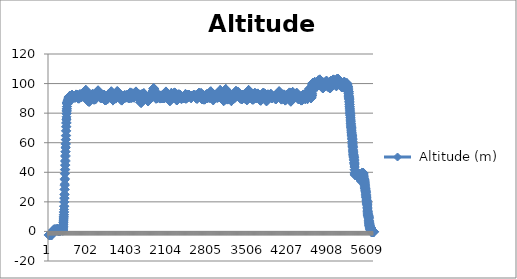
| Category |  Altitude (m) |
|---|---|
| 0 | -2.5 |
| 1 | -2.5 |
| 2 | -2.333 |
| 3 | -2.333 |
| 4 | -2.333 |
| 5 | -2.333 |
| 6 | -2.333 |
| 7 | -2.167 |
| 8 | -2.333 |
| 9 | -2.333 |
| 10 | -2.167 |
| 11 | -2.167 |
| 12 | -2.333 |
| 13 | -2.333 |
| 14 | -2.167 |
| 15 | -2.167 |
| 16 | -2.167 |
| 17 | -2.167 |
| 18 | -2.167 |
| 19 | -2.167 |
| 20 | -2.167 |
| 21 | -2.167 |
| 22 | -2.167 |
| 23 | -2 |
| 24 | -2 |
| 25 | -2.167 |
| 26 | -2.167 |
| 27 | -2.167 |
| 28 | -2.167 |
| 29 | -2.167 |
| 30 | -2.333 |
| 31 | -2.167 |
| 32 | -2.167 |
| 33 | -2.333 |
| 34 | -2.333 |
| 35 | -2.333 |
| 36 | -2.167 |
| 37 | -2.167 |
| 38 | -2.167 |
| 39 | -2.167 |
| 40 | -2.167 |
| 41 | -2 |
| 42 | -2 |
| 43 | -2 |
| 44 | -2 |
| 45 | -2.167 |
| 46 | -2.167 |
| 47 | -2.167 |
| 48 | -2.333 |
| 49 | -2.333 |
| 50 | -2.333 |
| 51 | -0.167 |
| 52 | -0.167 |
| 53 | -0.167 |
| 54 | -0.167 |
| 55 | -0.333 |
| 56 | -0.167 |
| 57 | -0.167 |
| 58 | -0.167 |
| 59 | -0.167 |
| 60 | 0 |
| 61 | -0.167 |
| 62 | 0 |
| 63 | 0.167 |
| 64 | 0 |
| 65 | -0.167 |
| 66 | -0.167 |
| 67 | -0.167 |
| 68 | -0.167 |
| 69 | -0.167 |
| 70 | -0.167 |
| 71 | 0 |
| 72 | 0 |
| 73 | -0.167 |
| 74 | -0.167 |
| 75 | -0.167 |
| 76 | -0.167 |
| 77 | 0.5 |
| 78 | 0.667 |
| 79 | 1 |
| 80 | 1 |
| 81 | 1 |
| 82 | 1.167 |
| 83 | 1.333 |
| 84 | 1.167 |
| 85 | 1.333 |
| 86 | 1.167 |
| 87 | 1 |
| 88 | 1.167 |
| 89 | 1.167 |
| 90 | 1.167 |
| 91 | 1.333 |
| 92 | 1.333 |
| 93 | 1.333 |
| 94 | 1.333 |
| 95 | 1.333 |
| 96 | 1.333 |
| 97 | 1.333 |
| 98 | 1.167 |
| 99 | 1.167 |
| 100 | 1.333 |
| 101 | 1.333 |
| 102 | 1.333 |
| 103 | 1.5 |
| 104 | 1.167 |
| 105 | 1.167 |
| 106 | 1 |
| 107 | 1.167 |
| 108 | 1.167 |
| 109 | 1 |
| 110 | 1 |
| 111 | 1 |
| 112 | 1.167 |
| 113 | 1.167 |
| 114 | 1.167 |
| 115 | 1.333 |
| 116 | 1.333 |
| 117 | 1.333 |
| 118 | 1.333 |
| 119 | 1.333 |
| 120 | 1.333 |
| 121 | 1.333 |
| 122 | 1.333 |
| 123 | 1.167 |
| 124 | 1.167 |
| 125 | 1.333 |
| 126 | 1.333 |
| 127 | 1.333 |
| 128 | 1.333 |
| 129 | 1.333 |
| 130 | 1.333 |
| 131 | 1.333 |
| 132 | 1.167 |
| 133 | 1.333 |
| 134 | 1.167 |
| 135 | 1.167 |
| 136 | 1.333 |
| 137 | 1.333 |
| 138 | 1.167 |
| 139 | 1.167 |
| 140 | 0.833 |
| 141 | 1 |
| 142 | 1 |
| 143 | 1.5 |
| 144 | 1.5 |
| 145 | 1.5 |
| 146 | 1.5 |
| 147 | 1.833 |
| 148 | 1.667 |
| 149 | 1.833 |
| 150 | 1.667 |
| 151 | 1.333 |
| 152 | 1.333 |
| 153 | 1.167 |
| 154 | 1.333 |
| 155 | 1.167 |
| 156 | 1.167 |
| 157 | 0.833 |
| 158 | 0.833 |
| 159 | 0.5 |
| 160 | 0.5 |
| 161 | 0.333 |
| 162 | 0.333 |
| 163 | 0.5 |
| 164 | 0.333 |
| 165 | 0.5 |
| 166 | 0.5 |
| 167 | 0.5 |
| 168 | 0.333 |
| 169 | 0.167 |
| 170 | 0.333 |
| 171 | 0.167 |
| 172 | 0.167 |
| 173 | 0.167 |
| 174 | 0.167 |
| 175 | 0.333 |
| 176 | 0.5 |
| 177 | 0.5 |
| 178 | 0.333 |
| 179 | 0.333 |
| 180 | 0.667 |
| 181 | 0.5 |
| 182 | 0.667 |
| 183 | 0.667 |
| 184 | 0.833 |
| 185 | 0.667 |
| 186 | 0.667 |
| 187 | 0.667 |
| 188 | 0.833 |
| 189 | 0.833 |
| 190 | 0.667 |
| 191 | 0.5 |
| 192 | 0.5 |
| 193 | 0.333 |
| 194 | 0.5 |
| 195 | 0.667 |
| 196 | 0.667 |
| 197 | 0.5 |
| 198 | 0.667 |
| 199 | 0.667 |
| 200 | 0.667 |
| 201 | 0.833 |
| 202 | 0.833 |
| 203 | 0.667 |
| 204 | 0.667 |
| 205 | 0.667 |
| 206 | 0.833 |
| 207 | 0.833 |
| 208 | 0.667 |
| 209 | 0.667 |
| 210 | 0.667 |
| 211 | 0.667 |
| 212 | 0.667 |
| 213 | 0.667 |
| 214 | 0.667 |
| 215 | 0.833 |
| 216 | 0.833 |
| 217 | 0.833 |
| 218 | 1 |
| 219 | 1 |
| 220 | 0.833 |
| 221 | 0.833 |
| 222 | 1 |
| 223 | 1 |
| 224 | 1 |
| 225 | 1 |
| 226 | 1 |
| 227 | 1 |
| 228 | 1 |
| 229 | 1 |
| 230 | 0.833 |
| 231 | 1 |
| 232 | 1 |
| 233 | 1 |
| 234 | 0.833 |
| 235 | 1 |
| 236 | 1 |
| 237 | 0.833 |
| 238 | 0.667 |
| 239 | 0.667 |
| 240 | 0.5 |
| 241 | 0.5 |
| 242 | 1.167 |
| 243 | 1.333 |
| 244 | 1.833 |
| 245 | 2.333 |
| 246 | 2.5 |
| 247 | 3.167 |
| 248 | 3.333 |
| 249 | 4.333 |
| 250 | 4.667 |
| 251 | 5.833 |
| 252 | 5.833 |
| 253 | 7 |
| 254 | 7.167 |
| 255 | 8.333 |
| 256 | 8.5 |
| 257 | 9.667 |
| 258 | 10 |
| 259 | 11.167 |
| 260 | 11.5 |
| 261 | 12.833 |
| 262 | 13.333 |
| 263 | 14.833 |
| 264 | 16.833 |
| 265 | 17.167 |
| 266 | 19.833 |
| 267 | 20 |
| 268 | 22.333 |
| 269 | 22.667 |
| 270 | 24.833 |
| 271 | 25.167 |
| 272 | 28.333 |
| 273 | 28.5 |
| 274 | 31.167 |
| 275 | 32 |
| 276 | 35 |
| 277 | 35.667 |
| 278 | 39 |
| 279 | 39.167 |
| 280 | 41.667 |
| 281 | 42 |
| 282 | 44.667 |
| 283 | 45 |
| 284 | 47.333 |
| 285 | 48 |
| 286 | 50.667 |
| 287 | 51.333 |
| 288 | 53.833 |
| 289 | 54 |
| 290 | 56.5 |
| 291 | 57 |
| 292 | 59 |
| 293 | 59.5 |
| 294 | 62 |
| 295 | 62.167 |
| 296 | 64.667 |
| 297 | 65 |
| 298 | 68 |
| 299 | 68 |
| 300 | 70.667 |
| 301 | 71 |
| 302 | 73.167 |
| 303 | 73.667 |
| 304 | 75.5 |
| 305 | 76 |
| 306 | 77.5 |
| 307 | 79.5 |
| 308 | 79.833 |
| 309 | 81.333 |
| 310 | 81.667 |
| 311 | 82.833 |
| 312 | 83 |
| 313 | 84.333 |
| 314 | 84.5 |
| 315 | 86.167 |
| 316 | 86.5 |
| 317 | 87.333 |
| 318 | 87.5 |
| 319 | 87.333 |
| 320 | 87.333 |
| 321 | 86.833 |
| 322 | 86.833 |
| 323 | 86.333 |
| 324 | 86.5 |
| 325 | 86.167 |
| 326 | 86.333 |
| 327 | 86.833 |
| 328 | 87 |
| 329 | 87.833 |
| 330 | 87.833 |
| 331 | 88.333 |
| 332 | 88.333 |
| 333 | 88.333 |
| 334 | 88.5 |
| 335 | 88.667 |
| 336 | 88.667 |
| 337 | 88.833 |
| 338 | 89 |
| 339 | 89.167 |
| 340 | 89.333 |
| 341 | 89.5 |
| 342 | 89.5 |
| 343 | 89.667 |
| 344 | 89.667 |
| 345 | 90 |
| 346 | 90 |
| 347 | 90.5 |
| 348 | 90.5 |
| 349 | 90.833 |
| 350 | 90.833 |
| 351 | 91.167 |
| 352 | 91.167 |
| 353 | 91.167 |
| 354 | 91 |
| 355 | 91 |
| 356 | 91 |
| 357 | 91.167 |
| 358 | 91 |
| 359 | 91.333 |
| 360 | 91.333 |
| 361 | 91.333 |
| 362 | 91.333 |
| 363 | 91.5 |
| 364 | 91.5 |
| 365 | 91.5 |
| 366 | 91.667 |
| 367 | 91.5 |
| 368 | 91.667 |
| 369 | 91.5 |
| 370 | 91.5 |
| 371 | 91.333 |
| 372 | 91.333 |
| 373 | 91.333 |
| 374 | 91.333 |
| 375 | 91.167 |
| 376 | 91.333 |
| 377 | 91.5 |
| 378 | 91.333 |
| 379 | 91.333 |
| 380 | 91.333 |
| 381 | 91.167 |
| 382 | 91.167 |
| 383 | 91.333 |
| 384 | 91.5 |
| 385 | 91.5 |
| 386 | 91.5 |
| 387 | 91.5 |
| 388 | 91.5 |
| 389 | 91.667 |
| 390 | 91.5 |
| 391 | 91.667 |
| 392 | 91.5 |
| 393 | 91.667 |
| 394 | 91.667 |
| 395 | 91.5 |
| 396 | 91.5 |
| 397 | 91.667 |
| 398 | 91.667 |
| 399 | 92 |
| 400 | 92 |
| 401 | 92.167 |
| 402 | 92.167 |
| 403 | 92.333 |
| 404 | 92.333 |
| 405 | 92.333 |
| 406 | 92.333 |
| 407 | 92.333 |
| 408 | 92.333 |
| 409 | 91.833 |
| 410 | 91.833 |
| 411 | 91.167 |
| 412 | 91.333 |
| 413 | 90.5 |
| 414 | 90.5 |
| 415 | 90.333 |
| 416 | 90.333 |
| 417 | 90.167 |
| 418 | 90.167 |
| 419 | 90.667 |
| 420 | 90.667 |
| 421 | 90.667 |
| 422 | 90.833 |
| 423 | 90.833 |
| 424 | 90.833 |
| 425 | 90.667 |
| 426 | 90.667 |
| 427 | 90.667 |
| 428 | 90.667 |
| 429 | 90.667 |
| 430 | 90.667 |
| 431 | 90.833 |
| 432 | 90.833 |
| 433 | 91.167 |
| 434 | 91.167 |
| 435 | 91.333 |
| 436 | 91.333 |
| 437 | 91 |
| 438 | 91.167 |
| 439 | 91.167 |
| 440 | 91.167 |
| 441 | 91.333 |
| 442 | 91.333 |
| 443 | 91.333 |
| 444 | 91.167 |
| 445 | 91.167 |
| 446 | 91 |
| 447 | 90.833 |
| 448 | 90.667 |
| 449 | 90.5 |
| 450 | 90.5 |
| 451 | 90.5 |
| 452 | 90.5 |
| 453 | 90.5 |
| 454 | 90.667 |
| 455 | 90.667 |
| 456 | 90.5 |
| 457 | 90.5 |
| 458 | 90.833 |
| 459 | 90.667 |
| 460 | 90.667 |
| 461 | 90.667 |
| 462 | 90.833 |
| 463 | 91 |
| 464 | 91.333 |
| 465 | 91.333 |
| 466 | 91.5 |
| 467 | 91.667 |
| 468 | 91.667 |
| 469 | 91.667 |
| 470 | 91.833 |
| 471 | 91.667 |
| 472 | 92.5 |
| 473 | 92.5 |
| 474 | 92.5 |
| 475 | 92.5 |
| 476 | 92.167 |
| 477 | 92 |
| 478 | 91.667 |
| 479 | 91.5 |
| 480 | 91.5 |
| 481 | 91.5 |
| 482 | 92 |
| 483 | 92.167 |
| 484 | 92.333 |
| 485 | 92.167 |
| 486 | 92.333 |
| 487 | 92.333 |
| 488 | 92.333 |
| 489 | 92.167 |
| 490 | 92.167 |
| 491 | 92 |
| 492 | 92.167 |
| 493 | 92.167 |
| 494 | 92.167 |
| 495 | 92.167 |
| 496 | 92.167 |
| 497 | 92.333 |
| 498 | 92.333 |
| 499 | 92 |
| 500 | 92 |
| 501 | 91.5 |
| 502 | 91.5 |
| 503 | 91 |
| 504 | 91 |
| 505 | 91 |
| 506 | 90.833 |
| 507 | 90.667 |
| 508 | 90.667 |
| 509 | 90.333 |
| 510 | 90.167 |
| 511 | 89.833 |
| 512 | 89.833 |
| 513 | 90 |
| 514 | 90 |
| 515 | 90.167 |
| 516 | 90 |
| 517 | 90.333 |
| 518 | 90.167 |
| 519 | 90 |
| 520 | 90.167 |
| 521 | 90 |
| 522 | 90 |
| 523 | 90 |
| 524 | 89.833 |
| 525 | 89.833 |
| 526 | 90 |
| 527 | 90 |
| 528 | 90.167 |
| 529 | 90.167 |
| 530 | 90.167 |
| 531 | 90.167 |
| 532 | 90.5 |
| 533 | 90.667 |
| 534 | 91.333 |
| 535 | 91.5 |
| 536 | 92 |
| 537 | 92.333 |
| 538 | 92.667 |
| 539 | 92.667 |
| 540 | 92.667 |
| 541 | 92.667 |
| 542 | 92.833 |
| 543 | 92.333 |
| 544 | 92.333 |
| 545 | 92.333 |
| 546 | 92.167 |
| 547 | 91.833 |
| 548 | 91.667 |
| 549 | 91.667 |
| 550 | 91.667 |
| 551 | 91.833 |
| 552 | 91.667 |
| 553 | 91.5 |
| 554 | 91.5 |
| 555 | 91.333 |
| 556 | 91.333 |
| 557 | 91.167 |
| 558 | 91.167 |
| 559 | 90.833 |
| 560 | 90.667 |
| 561 | 90.667 |
| 562 | 90.667 |
| 563 | 90.667 |
| 564 | 90.667 |
| 565 | 91 |
| 566 | 91 |
| 567 | 91.167 |
| 568 | 91.167 |
| 569 | 91.333 |
| 570 | 91.333 |
| 571 | 91.333 |
| 572 | 91.333 |
| 573 | 91.5 |
| 574 | 91.667 |
| 575 | 91.667 |
| 576 | 91.667 |
| 577 | 91.667 |
| 578 | 91.333 |
| 579 | 91.333 |
| 580 | 91.333 |
| 581 | 91.333 |
| 582 | 91.5 |
| 583 | 91.5 |
| 584 | 91.833 |
| 585 | 92 |
| 586 | 92.167 |
| 587 | 92.167 |
| 588 | 92.167 |
| 589 | 92.167 |
| 590 | 92.167 |
| 591 | 92.167 |
| 592 | 92.5 |
| 593 | 92.5 |
| 594 | 93 |
| 595 | 93.167 |
| 596 | 93.333 |
| 597 | 93.5 |
| 598 | 93.833 |
| 599 | 93.833 |
| 600 | 93.667 |
| 601 | 93 |
| 602 | 93 |
| 603 | 92.167 |
| 604 | 92.167 |
| 605 | 91.833 |
| 606 | 92 |
| 607 | 91.667 |
| 608 | 91.667 |
| 609 | 91.667 |
| 610 | 91.667 |
| 611 | 92 |
| 612 | 92 |
| 613 | 92.667 |
| 614 | 93 |
| 615 | 93.5 |
| 616 | 93.5 |
| 617 | 93.667 |
| 618 | 93.667 |
| 619 | 93.333 |
| 620 | 93.5 |
| 621 | 93.5 |
| 622 | 93.833 |
| 623 | 93.667 |
| 624 | 93.667 |
| 625 | 93.5 |
| 626 | 93.5 |
| 627 | 93.5 |
| 628 | 93.167 |
| 629 | 93.167 |
| 630 | 93.167 |
| 631 | 93.167 |
| 632 | 93.333 |
| 633 | 93.333 |
| 634 | 94 |
| 635 | 94.167 |
| 636 | 94.667 |
| 637 | 94.667 |
| 638 | 95 |
| 639 | 95.167 |
| 640 | 95.5 |
| 641 | 95.667 |
| 642 | 95.667 |
| 643 | 95.667 |
| 644 | 95 |
| 645 | 94.833 |
| 646 | 94.667 |
| 647 | 94.667 |
| 648 | 94.5 |
| 649 | 94.5 |
| 650 | 93.833 |
| 651 | 93.833 |
| 652 | 93.5 |
| 653 | 93.667 |
| 654 | 93.5 |
| 655 | 93.5 |
| 656 | 93.167 |
| 657 | 93.167 |
| 658 | 92.833 |
| 659 | 92.667 |
| 660 | 92.5 |
| 661 | 92.5 |
| 662 | 92 |
| 663 | 91.833 |
| 664 | 91.5 |
| 665 | 91.5 |
| 666 | 91.333 |
| 667 | 91.333 |
| 668 | 91.167 |
| 669 | 91.167 |
| 670 | 91 |
| 671 | 91 |
| 672 | 91 |
| 673 | 90.5 |
| 674 | 90.333 |
| 675 | 90 |
| 676 | 90 |
| 677 | 89.5 |
| 678 | 89.333 |
| 679 | 88.833 |
| 680 | 88.833 |
| 681 | 88.5 |
| 682 | 88.5 |
| 683 | 88.333 |
| 684 | 88.167 |
| 685 | 88.167 |
| 686 | 88 |
| 687 | 88.333 |
| 688 | 88.333 |
| 689 | 88.167 |
| 690 | 88.167 |
| 691 | 88.333 |
| 692 | 88.333 |
| 693 | 88.333 |
| 694 | 88.333 |
| 695 | 88.5 |
| 696 | 88.5 |
| 697 | 88.167 |
| 698 | 88 |
| 699 | 87.667 |
| 700 | 87.833 |
| 701 | 87.667 |
| 702 | 87.833 |
| 703 | 87.833 |
| 704 | 87.833 |
| 705 | 88.167 |
| 706 | 88.333 |
| 707 | 88.333 |
| 708 | 88.333 |
| 709 | 88.667 |
| 710 | 88.667 |
| 711 | 89 |
| 712 | 89.167 |
| 713 | 89.667 |
| 714 | 89.667 |
| 715 | 89.833 |
| 716 | 90 |
| 717 | 90 |
| 718 | 90 |
| 719 | 89.833 |
| 720 | 89.833 |
| 721 | 89.833 |
| 722 | 90 |
| 723 | 90.167 |
| 724 | 90.167 |
| 725 | 90.5 |
| 726 | 90.5 |
| 727 | 91 |
| 728 | 91.167 |
| 729 | 91.5 |
| 730 | 91.5 |
| 731 | 91.667 |
| 732 | 91.833 |
| 733 | 91.833 |
| 734 | 91.833 |
| 735 | 92 |
| 736 | 92 |
| 737 | 91.833 |
| 738 | 92 |
| 739 | 92 |
| 740 | 92 |
| 741 | 91.833 |
| 742 | 91.833 |
| 743 | 91.667 |
| 744 | 91.667 |
| 745 | 91.833 |
| 746 | 91.833 |
| 747 | 92 |
| 748 | 92.167 |
| 749 | 92.167 |
| 750 | 92.167 |
| 751 | 92.167 |
| 752 | 92.333 |
| 753 | 92.5 |
| 754 | 92.5 |
| 755 | 92.5 |
| 756 | 92.5 |
| 757 | 92.5 |
| 758 | 92.667 |
| 759 | 92.667 |
| 760 | 92.667 |
| 761 | 92.833 |
| 762 | 92.833 |
| 763 | 92.833 |
| 764 | 92.833 |
| 765 | 92.667 |
| 766 | 92.667 |
| 767 | 92.5 |
| 768 | 92.333 |
| 769 | 92.167 |
| 770 | 92.333 |
| 771 | 92.333 |
| 772 | 92 |
| 773 | 91.667 |
| 774 | 90.5 |
| 775 | 90.333 |
| 776 | 89.667 |
| 777 | 89.667 |
| 778 | 89.5 |
| 779 | 89.5 |
| 780 | 89.333 |
| 781 | 89.333 |
| 782 | 89.167 |
| 783 | 89.333 |
| 784 | 89.333 |
| 785 | 89.333 |
| 786 | 89.167 |
| 787 | 89.333 |
| 788 | 89.167 |
| 789 | 89.167 |
| 790 | 89.333 |
| 791 | 89.333 |
| 792 | 89.167 |
| 793 | 89.167 |
| 794 | 89.333 |
| 795 | 89.333 |
| 796 | 89.333 |
| 797 | 89.333 |
| 798 | 89.5 |
| 799 | 89.5 |
| 800 | 89.667 |
| 801 | 89.833 |
| 802 | 89.833 |
| 803 | 90.333 |
| 804 | 90.333 |
| 805 | 90.667 |
| 806 | 90.667 |
| 807 | 90.667 |
| 808 | 90.667 |
| 809 | 90.167 |
| 810 | 90.167 |
| 811 | 89.667 |
| 812 | 89.667 |
| 813 | 89.5 |
| 814 | 89.5 |
| 815 | 89.667 |
| 816 | 89.833 |
| 817 | 89.667 |
| 818 | 89.833 |
| 819 | 90.167 |
| 820 | 90.333 |
| 821 | 90.5 |
| 822 | 90.5 |
| 823 | 91 |
| 824 | 91.167 |
| 825 | 91.667 |
| 826 | 91.667 |
| 827 | 92.333 |
| 828 | 92.333 |
| 829 | 92.667 |
| 830 | 92.667 |
| 831 | 92.667 |
| 832 | 92.833 |
| 833 | 93.167 |
| 834 | 93.167 |
| 835 | 93.5 |
| 836 | 93.5 |
| 837 | 93.167 |
| 838 | 93.167 |
| 839 | 92.833 |
| 840 | 92.833 |
| 841 | 92.5 |
| 842 | 92.333 |
| 843 | 92 |
| 844 | 92.167 |
| 845 | 92.5 |
| 846 | 92.5 |
| 847 | 93 |
| 848 | 93.167 |
| 849 | 93.833 |
| 850 | 94.333 |
| 851 | 94.5 |
| 852 | 94.667 |
| 853 | 94.833 |
| 854 | 95.167 |
| 855 | 95.167 |
| 856 | 95.333 |
| 857 | 95.5 |
| 858 | 95.167 |
| 859 | 95 |
| 860 | 94.333 |
| 861 | 94.333 |
| 862 | 94 |
| 863 | 93.833 |
| 864 | 93.667 |
| 865 | 93.833 |
| 866 | 94 |
| 867 | 93.833 |
| 868 | 93.333 |
| 869 | 93.333 |
| 870 | 93.167 |
| 871 | 93.167 |
| 872 | 93.167 |
| 873 | 93.167 |
| 874 | 93.167 |
| 875 | 93 |
| 876 | 93 |
| 877 | 92.167 |
| 878 | 92.333 |
| 879 | 92 |
| 880 | 92 |
| 881 | 91.667 |
| 882 | 91.667 |
| 883 | 91.667 |
| 884 | 91.667 |
| 885 | 92 |
| 886 | 92 |
| 887 | 92.333 |
| 888 | 92.333 |
| 889 | 92.667 |
| 890 | 92.667 |
| 891 | 92.5 |
| 892 | 92.333 |
| 893 | 92 |
| 894 | 91.833 |
| 895 | 91.5 |
| 896 | 91.5 |
| 897 | 90.833 |
| 898 | 90.833 |
| 899 | 90.5 |
| 900 | 90.5 |
| 901 | 91 |
| 902 | 91 |
| 903 | 90.833 |
| 904 | 90.833 |
| 905 | 90.833 |
| 906 | 90.833 |
| 907 | 90.667 |
| 908 | 90.667 |
| 909 | 90.333 |
| 910 | 90.333 |
| 911 | 90.167 |
| 912 | 90.167 |
| 913 | 90.333 |
| 914 | 90.333 |
| 915 | 91 |
| 916 | 91.167 |
| 917 | 92 |
| 918 | 92.167 |
| 919 | 92.5 |
| 920 | 92.5 |
| 921 | 92.667 |
| 922 | 92.667 |
| 923 | 92.5 |
| 924 | 92.5 |
| 925 | 92 |
| 926 | 91.833 |
| 927 | 91.667 |
| 928 | 91.333 |
| 929 | 91.167 |
| 930 | 91.167 |
| 931 | 91.167 |
| 932 | 91.167 |
| 933 | 91.333 |
| 934 | 91.333 |
| 935 | 91.667 |
| 936 | 92 |
| 937 | 92 |
| 938 | 92.333 |
| 939 | 92.333 |
| 940 | 92.167 |
| 941 | 92 |
| 942 | 91.667 |
| 943 | 91.667 |
| 944 | 91.667 |
| 945 | 91.667 |
| 946 | 91.167 |
| 947 | 91.167 |
| 948 | 91.333 |
| 949 | 91.5 |
| 950 | 92.167 |
| 951 | 92.333 |
| 952 | 92.5 |
| 953 | 92.5 |
| 954 | 92.333 |
| 955 | 92.333 |
| 956 | 92.167 |
| 957 | 92 |
| 958 | 91.667 |
| 959 | 91.667 |
| 960 | 91.667 |
| 961 | 91.833 |
| 962 | 92.167 |
| 963 | 92.333 |
| 964 | 92.5 |
| 965 | 92.5 |
| 966 | 92 |
| 967 | 91.833 |
| 968 | 91 |
| 969 | 90.833 |
| 970 | 90.167 |
| 971 | 90.167 |
| 972 | 89.5 |
| 973 | 89.333 |
| 974 | 89 |
| 975 | 88.833 |
| 976 | 88.667 |
| 977 | 88.833 |
| 978 | 88.833 |
| 979 | 89 |
| 980 | 89 |
| 981 | 89 |
| 982 | 89 |
| 983 | 89 |
| 984 | 89 |
| 985 | 89 |
| 986 | 89.167 |
| 987 | 89.167 |
| 988 | 89 |
| 989 | 89 |
| 990 | 88.833 |
| 991 | 88.667 |
| 992 | 88.833 |
| 993 | 89 |
| 994 | 89.333 |
| 995 | 89.333 |
| 996 | 89.667 |
| 997 | 89.667 |
| 998 | 90 |
| 999 | 90 |
| 1000 | 90.167 |
| 1001 | 90.167 |
| 1002 | 90.333 |
| 1003 | 90.333 |
| 1004 | 90.667 |
| 1005 | 90.667 |
| 1006 | 90.333 |
| 1007 | 90.333 |
| 1008 | 90 |
| 1009 | 89.833 |
| 1010 | 89.667 |
| 1011 | 89.667 |
| 1012 | 89.5 |
| 1013 | 89.333 |
| 1014 | 89.333 |
| 1015 | 89.333 |
| 1016 | 89.333 |
| 1017 | 89.333 |
| 1018 | 89.5 |
| 1019 | 89.333 |
| 1020 | 89.333 |
| 1021 | 89.5 |
| 1022 | 89.667 |
| 1023 | 89.833 |
| 1024 | 90.167 |
| 1025 | 90 |
| 1026 | 90.333 |
| 1027 | 90.333 |
| 1028 | 90.5 |
| 1029 | 90.5 |
| 1030 | 90.667 |
| 1031 | 90.667 |
| 1032 | 91 |
| 1033 | 91.167 |
| 1034 | 91.333 |
| 1035 | 91.5 |
| 1036 | 91.833 |
| 1037 | 91.833 |
| 1038 | 92.167 |
| 1039 | 92.333 |
| 1040 | 92.667 |
| 1041 | 92.667 |
| 1042 | 92.667 |
| 1043 | 92.667 |
| 1044 | 92.667 |
| 1045 | 92.5 |
| 1046 | 92.667 |
| 1047 | 92.667 |
| 1048 | 92.833 |
| 1049 | 92.833 |
| 1050 | 93 |
| 1051 | 93 |
| 1052 | 92.833 |
| 1053 | 92.667 |
| 1054 | 92.667 |
| 1055 | 92.667 |
| 1056 | 92.667 |
| 1057 | 92.667 |
| 1058 | 92.833 |
| 1059 | 93 |
| 1060 | 93 |
| 1061 | 93 |
| 1062 | 93 |
| 1063 | 93.167 |
| 1064 | 93.333 |
| 1065 | 93.167 |
| 1066 | 93.167 |
| 1067 | 93 |
| 1068 | 93 |
| 1069 | 93.167 |
| 1070 | 93.167 |
| 1071 | 93.167 |
| 1072 | 93.167 |
| 1073 | 92.833 |
| 1074 | 92.667 |
| 1075 | 92.5 |
| 1076 | 92.5 |
| 1077 | 92.5 |
| 1078 | 92.5 |
| 1079 | 92.5 |
| 1080 | 92.5 |
| 1081 | 93 |
| 1082 | 93.167 |
| 1083 | 94.333 |
| 1084 | 94.333 |
| 1085 | 94.5 |
| 1086 | 94.5 |
| 1087 | 94.667 |
| 1088 | 94.833 |
| 1089 | 93.667 |
| 1090 | 93.667 |
| 1091 | 92.667 |
| 1092 | 92.5 |
| 1093 | 92 |
| 1094 | 92 |
| 1095 | 91.167 |
| 1096 | 91 |
| 1097 | 90.5 |
| 1098 | 90.5 |
| 1099 | 90.5 |
| 1100 | 90.333 |
| 1101 | 90.333 |
| 1102 | 90.333 |
| 1103 | 90.5 |
| 1104 | 90.5 |
| 1105 | 90.333 |
| 1106 | 90.333 |
| 1107 | 90 |
| 1108 | 90 |
| 1109 | 89.667 |
| 1110 | 89.667 |
| 1111 | 89.5 |
| 1112 | 89.5 |
| 1113 | 89.333 |
| 1114 | 89.333 |
| 1115 | 89 |
| 1116 | 88.833 |
| 1117 | 88.667 |
| 1118 | 88.667 |
| 1119 | 88.833 |
| 1120 | 88.833 |
| 1121 | 89.333 |
| 1122 | 89.167 |
| 1123 | 89.5 |
| 1124 | 89.5 |
| 1125 | 89.667 |
| 1126 | 89.667 |
| 1127 | 89.5 |
| 1128 | 89.667 |
| 1129 | 90 |
| 1130 | 90 |
| 1131 | 90.333 |
| 1132 | 90.333 |
| 1133 | 90.667 |
| 1134 | 90.667 |
| 1135 | 91 |
| 1136 | 91 |
| 1137 | 91.167 |
| 1138 | 91.333 |
| 1139 | 91.667 |
| 1140 | 91.667 |
| 1141 | 92.167 |
| 1142 | 92.167 |
| 1143 | 92.5 |
| 1144 | 92.5 |
| 1145 | 92.167 |
| 1146 | 92.167 |
| 1147 | 91.833 |
| 1148 | 91.833 |
| 1149 | 91.333 |
| 1150 | 91.167 |
| 1151 | 91 |
| 1152 | 91 |
| 1153 | 90.667 |
| 1154 | 90.667 |
| 1155 | 90.167 |
| 1156 | 90 |
| 1157 | 89.833 |
| 1158 | 89.833 |
| 1159 | 90 |
| 1160 | 90 |
| 1161 | 90.167 |
| 1162 | 90.167 |
| 1163 | 90.167 |
| 1164 | 90.167 |
| 1165 | 90.167 |
| 1166 | 90 |
| 1167 | 90 |
| 1168 | 89.833 |
| 1169 | 90 |
| 1170 | 90 |
| 1171 | 90.167 |
| 1172 | 90.333 |
| 1173 | 90.833 |
| 1174 | 91 |
| 1175 | 91.5 |
| 1176 | 91.833 |
| 1177 | 92.5 |
| 1178 | 92.667 |
| 1179 | 93 |
| 1180 | 93 |
| 1181 | 93.333 |
| 1182 | 93.333 |
| 1183 | 93.333 |
| 1184 | 93.333 |
| 1185 | 93.667 |
| 1186 | 93.667 |
| 1187 | 94 |
| 1188 | 94 |
| 1189 | 94.333 |
| 1190 | 94.333 |
| 1191 | 94.667 |
| 1192 | 95 |
| 1193 | 94.667 |
| 1194 | 94.167 |
| 1195 | 94.167 |
| 1196 | 94 |
| 1197 | 94 |
| 1198 | 94.5 |
| 1199 | 94.333 |
| 1200 | 94.333 |
| 1201 | 94.333 |
| 1202 | 94 |
| 1203 | 94 |
| 1204 | 94 |
| 1205 | 93.833 |
| 1206 | 93.833 |
| 1207 | 93.833 |
| 1208 | 93.667 |
| 1209 | 93.333 |
| 1210 | 93.333 |
| 1211 | 93.167 |
| 1212 | 92.833 |
| 1213 | 92.667 |
| 1214 | 92.167 |
| 1215 | 92.167 |
| 1216 | 91.667 |
| 1217 | 91.667 |
| 1218 | 91.167 |
| 1219 | 91.167 |
| 1220 | 91 |
| 1221 | 91 |
| 1222 | 90.667 |
| 1223 | 90.833 |
| 1224 | 90.833 |
| 1225 | 91 |
| 1226 | 91.333 |
| 1227 | 91.333 |
| 1228 | 91.5 |
| 1229 | 91.5 |
| 1230 | 91.667 |
| 1231 | 91.667 |
| 1232 | 92 |
| 1233 | 91.833 |
| 1234 | 92 |
| 1235 | 92 |
| 1236 | 92 |
| 1237 | 92 |
| 1238 | 91.5 |
| 1239 | 91.5 |
| 1240 | 91.167 |
| 1241 | 91.333 |
| 1242 | 90.667 |
| 1243 | 90.667 |
| 1244 | 90.167 |
| 1245 | 90.167 |
| 1246 | 89.667 |
| 1247 | 89.667 |
| 1248 | 89.5 |
| 1249 | 89.5 |
| 1250 | 89.667 |
| 1251 | 89.667 |
| 1252 | 89.833 |
| 1253 | 89.833 |
| 1254 | 89.833 |
| 1255 | 89.833 |
| 1256 | 89.833 |
| 1257 | 89.833 |
| 1258 | 89.833 |
| 1259 | 89.833 |
| 1260 | 89.833 |
| 1261 | 89.667 |
| 1262 | 89.667 |
| 1263 | 89.333 |
| 1264 | 89.333 |
| 1265 | 89.167 |
| 1266 | 89.167 |
| 1267 | 89 |
| 1268 | 89 |
| 1269 | 88.833 |
| 1270 | 88.667 |
| 1271 | 88.5 |
| 1272 | 88.5 |
| 1273 | 88.667 |
| 1274 | 88.667 |
| 1275 | 88.667 |
| 1276 | 88.667 |
| 1277 | 88.833 |
| 1278 | 88.833 |
| 1279 | 89.167 |
| 1280 | 89.167 |
| 1281 | 89.5 |
| 1282 | 89.5 |
| 1283 | 89.833 |
| 1284 | 90 |
| 1285 | 90.333 |
| 1286 | 90.333 |
| 1287 | 90.833 |
| 1288 | 90.833 |
| 1289 | 91 |
| 1290 | 91 |
| 1291 | 91.5 |
| 1292 | 91.667 |
| 1293 | 91.5 |
| 1294 | 91.5 |
| 1295 | 91.167 |
| 1296 | 91.167 |
| 1297 | 90.833 |
| 1298 | 90.667 |
| 1299 | 90.5 |
| 1300 | 90.333 |
| 1301 | 90.5 |
| 1302 | 90.5 |
| 1303 | 90.5 |
| 1304 | 90.667 |
| 1305 | 90.667 |
| 1306 | 90.833 |
| 1307 | 91.167 |
| 1308 | 91.333 |
| 1309 | 91.167 |
| 1310 | 91.167 |
| 1311 | 91.5 |
| 1312 | 91.5 |
| 1313 | 91.833 |
| 1314 | 91.833 |
| 1315 | 91.667 |
| 1316 | 91.5 |
| 1317 | 91.5 |
| 1318 | 91.5 |
| 1319 | 91.833 |
| 1320 | 91.833 |
| 1321 | 92 |
| 1322 | 91.833 |
| 1323 | 92.167 |
| 1324 | 92.167 |
| 1325 | 92 |
| 1326 | 92 |
| 1327 | 91.833 |
| 1328 | 91.667 |
| 1329 | 91.5 |
| 1330 | 91.5 |
| 1331 | 91.333 |
| 1332 | 91.333 |
| 1333 | 91.167 |
| 1334 | 91.167 |
| 1335 | 91 |
| 1336 | 91 |
| 1337 | 90.667 |
| 1338 | 90.667 |
| 1339 | 90.333 |
| 1340 | 90.5 |
| 1341 | 90.833 |
| 1342 | 90.833 |
| 1343 | 91.333 |
| 1344 | 91.333 |
| 1345 | 91.333 |
| 1346 | 91.333 |
| 1347 | 91.167 |
| 1348 | 91 |
| 1349 | 91 |
| 1350 | 91 |
| 1351 | 91 |
| 1352 | 91 |
| 1353 | 91.333 |
| 1354 | 91.333 |
| 1355 | 91.5 |
| 1356 | 91.333 |
| 1357 | 91.333 |
| 1358 | 91.333 |
| 1359 | 91.333 |
| 1360 | 91.167 |
| 1361 | 91.5 |
| 1362 | 91.5 |
| 1363 | 91.833 |
| 1364 | 92 |
| 1365 | 92.333 |
| 1366 | 92.333 |
| 1367 | 92.333 |
| 1368 | 92.333 |
| 1369 | 92.167 |
| 1370 | 92 |
| 1371 | 92 |
| 1372 | 92 |
| 1373 | 91.5 |
| 1374 | 91.5 |
| 1375 | 91.5 |
| 1376 | 91.5 |
| 1377 | 91.5 |
| 1378 | 91.333 |
| 1379 | 91.333 |
| 1380 | 91.5 |
| 1381 | 91.167 |
| 1382 | 91.167 |
| 1383 | 90.667 |
| 1384 | 90.667 |
| 1385 | 90.333 |
| 1386 | 90.333 |
| 1387 | 90.333 |
| 1388 | 90.333 |
| 1389 | 90.667 |
| 1390 | 90.833 |
| 1391 | 91 |
| 1392 | 91 |
| 1393 | 91 |
| 1394 | 90.833 |
| 1395 | 91.167 |
| 1396 | 91 |
| 1397 | 90.667 |
| 1398 | 90.5 |
| 1399 | 90.333 |
| 1400 | 90.333 |
| 1401 | 90.333 |
| 1402 | 90.333 |
| 1403 | 90.167 |
| 1404 | 90.167 |
| 1405 | 90.333 |
| 1406 | 90.333 |
| 1407 | 90.333 |
| 1408 | 90.5 |
| 1409 | 90.667 |
| 1410 | 90.667 |
| 1411 | 90.833 |
| 1412 | 91.333 |
| 1413 | 91.333 |
| 1414 | 92 |
| 1415 | 92 |
| 1416 | 92.333 |
| 1417 | 92.5 |
| 1418 | 93 |
| 1419 | 93.333 |
| 1420 | 93.667 |
| 1421 | 93.833 |
| 1422 | 94 |
| 1423 | 94 |
| 1424 | 94 |
| 1425 | 93.167 |
| 1426 | 93 |
| 1427 | 91.5 |
| 1428 | 91.5 |
| 1429 | 90.667 |
| 1430 | 90.667 |
| 1431 | 90.5 |
| 1432 | 90.5 |
| 1433 | 90.333 |
| 1434 | 90.333 |
| 1435 | 90.5 |
| 1436 | 90.5 |
| 1437 | 91.5 |
| 1438 | 91.5 |
| 1439 | 91 |
| 1440 | 90.667 |
| 1441 | 90.667 |
| 1442 | 90.667 |
| 1443 | 90.667 |
| 1444 | 90.5 |
| 1445 | 90.5 |
| 1446 | 90.5 |
| 1447 | 90.667 |
| 1448 | 90.833 |
| 1449 | 90.833 |
| 1450 | 91.667 |
| 1451 | 91.833 |
| 1452 | 92.333 |
| 1453 | 92.333 |
| 1454 | 92.333 |
| 1455 | 92.5 |
| 1456 | 92.667 |
| 1457 | 92.833 |
| 1458 | 93 |
| 1459 | 93 |
| 1460 | 93 |
| 1461 | 93.167 |
| 1462 | 93.333 |
| 1463 | 93.333 |
| 1464 | 93.167 |
| 1465 | 93.167 |
| 1466 | 93 |
| 1467 | 93 |
| 1468 | 92.333 |
| 1469 | 92.333 |
| 1470 | 91.333 |
| 1471 | 91.333 |
| 1472 | 90.833 |
| 1473 | 90.833 |
| 1474 | 90.833 |
| 1475 | 91 |
| 1476 | 91.167 |
| 1477 | 91 |
| 1478 | 90.667 |
| 1479 | 90.667 |
| 1480 | 90.5 |
| 1481 | 90.5 |
| 1482 | 90.833 |
| 1483 | 91.167 |
| 1484 | 91.833 |
| 1485 | 91.833 |
| 1486 | 92 |
| 1487 | 91.833 |
| 1488 | 91.667 |
| 1489 | 91.667 |
| 1490 | 91.833 |
| 1491 | 91.833 |
| 1492 | 92 |
| 1493 | 92 |
| 1494 | 92.167 |
| 1495 | 92.333 |
| 1496 | 92.167 |
| 1497 | 92.167 |
| 1498 | 92 |
| 1499 | 92 |
| 1500 | 92.5 |
| 1501 | 92.5 |
| 1502 | 92.5 |
| 1503 | 92.5 |
| 1504 | 92.333 |
| 1505 | 92.167 |
| 1506 | 92 |
| 1507 | 92 |
| 1508 | 92.167 |
| 1509 | 92.167 |
| 1510 | 92.333 |
| 1511 | 92.5 |
| 1512 | 93 |
| 1513 | 93 |
| 1514 | 93.5 |
| 1515 | 93.5 |
| 1516 | 94 |
| 1517 | 94.167 |
| 1518 | 94.5 |
| 1519 | 94.667 |
| 1520 | 94.667 |
| 1521 | 94.667 |
| 1522 | 94.5 |
| 1523 | 94.5 |
| 1524 | 94.333 |
| 1525 | 94 |
| 1526 | 94 |
| 1527 | 93.833 |
| 1528 | 93.833 |
| 1529 | 93.667 |
| 1530 | 93.667 |
| 1531 | 93.333 |
| 1532 | 93.333 |
| 1533 | 93.333 |
| 1534 | 93.5 |
| 1535 | 93.667 |
| 1536 | 93.833 |
| 1537 | 93.5 |
| 1538 | 93.333 |
| 1539 | 93.333 |
| 1540 | 93.167 |
| 1541 | 93 |
| 1542 | 92.833 |
| 1543 | 92.667 |
| 1544 | 92.5 |
| 1545 | 92.167 |
| 1546 | 92 |
| 1547 | 91.333 |
| 1548 | 91.333 |
| 1549 | 90.667 |
| 1550 | 90.667 |
| 1551 | 90.833 |
| 1552 | 90.833 |
| 1553 | 90.667 |
| 1554 | 90.833 |
| 1555 | 90.667 |
| 1556 | 90.667 |
| 1557 | 90.833 |
| 1558 | 91.167 |
| 1559 | 91.5 |
| 1560 | 91.667 |
| 1561 | 92 |
| 1562 | 92.167 |
| 1563 | 92.333 |
| 1564 | 92.333 |
| 1565 | 92.333 |
| 1566 | 92.333 |
| 1567 | 92.5 |
| 1568 | 92.5 |
| 1569 | 92.667 |
| 1570 | 92.667 |
| 1571 | 92.5 |
| 1572 | 92.5 |
| 1573 | 92.333 |
| 1574 | 92.333 |
| 1575 | 92.333 |
| 1576 | 92.333 |
| 1577 | 92.5 |
| 1578 | 92.5 |
| 1579 | 92.333 |
| 1580 | 92.5 |
| 1581 | 92.5 |
| 1582 | 92.667 |
| 1583 | 92.667 |
| 1584 | 92.5 |
| 1585 | 92.5 |
| 1586 | 91.833 |
| 1587 | 91.833 |
| 1588 | 91.167 |
| 1589 | 91 |
| 1590 | 90.333 |
| 1591 | 90.333 |
| 1592 | 90.167 |
| 1593 | 90 |
| 1594 | 89.667 |
| 1595 | 89.667 |
| 1596 | 88.5 |
| 1597 | 88.5 |
| 1598 | 87.5 |
| 1599 | 87.5 |
| 1600 | 87.333 |
| 1601 | 87.333 |
| 1602 | 87.667 |
| 1603 | 87.667 |
| 1604 | 87.333 |
| 1605 | 87.333 |
| 1606 | 87.333 |
| 1607 | 87.333 |
| 1608 | 87 |
| 1609 | 87 |
| 1610 | 87 |
| 1611 | 87 |
| 1612 | 87.667 |
| 1613 | 87.667 |
| 1614 | 88.5 |
| 1615 | 88.667 |
| 1616 | 89.5 |
| 1617 | 89.667 |
| 1618 | 90.333 |
| 1619 | 90.5 |
| 1620 | 91.167 |
| 1621 | 91.167 |
| 1622 | 91.667 |
| 1623 | 91.667 |
| 1624 | 92 |
| 1625 | 92 |
| 1626 | 92.5 |
| 1627 | 92.5 |
| 1628 | 92.833 |
| 1629 | 93 |
| 1630 | 92.833 |
| 1631 | 92.833 |
| 1632 | 92.167 |
| 1633 | 92 |
| 1634 | 91.667 |
| 1635 | 91.5 |
| 1636 | 91.667 |
| 1637 | 91.5 |
| 1638 | 91.333 |
| 1639 | 91.167 |
| 1640 | 90.667 |
| 1641 | 90.5 |
| 1642 | 90.833 |
| 1643 | 90.833 |
| 1644 | 91 |
| 1645 | 91 |
| 1646 | 91 |
| 1647 | 91 |
| 1648 | 91.333 |
| 1649 | 91.333 |
| 1650 | 91.833 |
| 1651 | 91.833 |
| 1652 | 92.333 |
| 1653 | 92.333 |
| 1654 | 92.667 |
| 1655 | 93 |
| 1656 | 93.333 |
| 1657 | 93.5 |
| 1658 | 93.5 |
| 1659 | 93.333 |
| 1660 | 93.167 |
| 1661 | 93.167 |
| 1662 | 92.667 |
| 1663 | 92.5 |
| 1664 | 92 |
| 1665 | 92 |
| 1666 | 91.5 |
| 1667 | 91.167 |
| 1668 | 90.667 |
| 1669 | 90.5 |
| 1670 | 90.333 |
| 1671 | 90.333 |
| 1672 | 90.5 |
| 1673 | 90.667 |
| 1674 | 91 |
| 1675 | 91.167 |
| 1676 | 91.167 |
| 1677 | 91.667 |
| 1678 | 91.667 |
| 1679 | 91.5 |
| 1680 | 91.5 |
| 1681 | 91 |
| 1682 | 91 |
| 1683 | 90.5 |
| 1684 | 90.333 |
| 1685 | 90 |
| 1686 | 90.167 |
| 1687 | 89.833 |
| 1688 | 89.833 |
| 1689 | 89.833 |
| 1690 | 89.667 |
| 1691 | 89.5 |
| 1692 | 89.667 |
| 1693 | 89.667 |
| 1694 | 89.667 |
| 1695 | 90 |
| 1696 | 90.167 |
| 1697 | 90.667 |
| 1698 | 90.667 |
| 1699 | 91.167 |
| 1700 | 91.167 |
| 1701 | 91.167 |
| 1702 | 91.167 |
| 1703 | 91.167 |
| 1704 | 91.167 |
| 1705 | 91 |
| 1706 | 91 |
| 1707 | 90.667 |
| 1708 | 90.667 |
| 1709 | 90.333 |
| 1710 | 90.333 |
| 1711 | 90.167 |
| 1712 | 90.167 |
| 1713 | 90.333 |
| 1714 | 90.167 |
| 1715 | 90.5 |
| 1716 | 90.5 |
| 1717 | 90.5 |
| 1718 | 90.5 |
| 1719 | 89.833 |
| 1720 | 89.833 |
| 1721 | 89.333 |
| 1722 | 89.333 |
| 1723 | 89 |
| 1724 | 89 |
| 1725 | 88.667 |
| 1726 | 88.5 |
| 1727 | 88.333 |
| 1728 | 88.333 |
| 1729 | 88.167 |
| 1730 | 88.167 |
| 1731 | 88 |
| 1732 | 88.167 |
| 1733 | 88.167 |
| 1734 | 88.167 |
| 1735 | 88.5 |
| 1736 | 88.5 |
| 1737 | 88.5 |
| 1738 | 88.5 |
| 1739 | 88.833 |
| 1740 | 88.833 |
| 1741 | 89.167 |
| 1742 | 89.167 |
| 1743 | 89.667 |
| 1744 | 89.667 |
| 1745 | 90 |
| 1746 | 90.167 |
| 1747 | 90.5 |
| 1748 | 90.5 |
| 1749 | 90.667 |
| 1750 | 90.833 |
| 1751 | 91 |
| 1752 | 90.833 |
| 1753 | 91 |
| 1754 | 91.167 |
| 1755 | 91 |
| 1756 | 91 |
| 1757 | 91 |
| 1758 | 90.833 |
| 1759 | 91 |
| 1760 | 91 |
| 1761 | 91 |
| 1762 | 91 |
| 1763 | 90.667 |
| 1764 | 90.667 |
| 1765 | 91.167 |
| 1766 | 91.167 |
| 1767 | 91.333 |
| 1768 | 91.333 |
| 1769 | 91.333 |
| 1770 | 91.333 |
| 1771 | 91 |
| 1772 | 91.167 |
| 1773 | 91 |
| 1774 | 91 |
| 1775 | 91 |
| 1776 | 91.167 |
| 1777 | 91.167 |
| 1778 | 91.5 |
| 1779 | 91.667 |
| 1780 | 92 |
| 1781 | 92.167 |
| 1782 | 92 |
| 1783 | 91.833 |
| 1784 | 91.833 |
| 1785 | 91.833 |
| 1786 | 92.167 |
| 1787 | 92 |
| 1788 | 92 |
| 1789 | 92 |
| 1790 | 91.667 |
| 1791 | 91.667 |
| 1792 | 91.833 |
| 1793 | 91.667 |
| 1794 | 92.167 |
| 1795 | 92.167 |
| 1796 | 92 |
| 1797 | 92 |
| 1798 | 91.5 |
| 1799 | 91.5 |
| 1800 | 92 |
| 1801 | 92 |
| 1802 | 92.667 |
| 1803 | 92.667 |
| 1804 | 93.167 |
| 1805 | 93.167 |
| 1806 | 93.333 |
| 1807 | 93.333 |
| 1808 | 93.5 |
| 1809 | 93.5 |
| 1810 | 93.5 |
| 1811 | 93.333 |
| 1812 | 93.333 |
| 1813 | 93.333 |
| 1814 | 93.833 |
| 1815 | 93.833 |
| 1816 | 94 |
| 1817 | 94.167 |
| 1818 | 94.5 |
| 1819 | 94.5 |
| 1820 | 94.833 |
| 1821 | 94.667 |
| 1822 | 95.167 |
| 1823 | 95.167 |
| 1824 | 95.333 |
| 1825 | 95.5 |
| 1826 | 96.333 |
| 1827 | 96.5 |
| 1828 | 97 |
| 1829 | 97 |
| 1830 | 96.667 |
| 1831 | 96.667 |
| 1832 | 96.667 |
| 1833 | 96.667 |
| 1834 | 96.167 |
| 1835 | 96.167 |
| 1836 | 95.5 |
| 1837 | 95.333 |
| 1838 | 94.667 |
| 1839 | 94.333 |
| 1840 | 93.667 |
| 1841 | 93.5 |
| 1842 | 93 |
| 1843 | 92.833 |
| 1844 | 92.333 |
| 1845 | 92.333 |
| 1846 | 92.167 |
| 1847 | 92.167 |
| 1848 | 92.167 |
| 1849 | 92.167 |
| 1850 | 92.5 |
| 1851 | 92.5 |
| 1852 | 92.5 |
| 1853 | 92.5 |
| 1854 | 92.833 |
| 1855 | 92.833 |
| 1856 | 92.833 |
| 1857 | 92.5 |
| 1858 | 92.667 |
| 1859 | 92.333 |
| 1860 | 92.333 |
| 1861 | 92 |
| 1862 | 92 |
| 1863 | 91 |
| 1864 | 90.833 |
| 1865 | 90.333 |
| 1866 | 90.167 |
| 1867 | 90 |
| 1868 | 90 |
| 1869 | 89.833 |
| 1870 | 89.833 |
| 1871 | 89.833 |
| 1872 | 89.833 |
| 1873 | 89.833 |
| 1874 | 90 |
| 1875 | 90.167 |
| 1876 | 90.167 |
| 1877 | 91 |
| 1878 | 91 |
| 1879 | 90.833 |
| 1880 | 90.667 |
| 1881 | 90.5 |
| 1882 | 90.5 |
| 1883 | 90.333 |
| 1884 | 90.333 |
| 1885 | 90.333 |
| 1886 | 90.333 |
| 1887 | 90.333 |
| 1888 | 90.333 |
| 1889 | 90.167 |
| 1890 | 90.167 |
| 1891 | 90.333 |
| 1892 | 90.5 |
| 1893 | 90.833 |
| 1894 | 90.833 |
| 1895 | 91.167 |
| 1896 | 91.167 |
| 1897 | 91.167 |
| 1898 | 91.167 |
| 1899 | 91.5 |
| 1900 | 91.5 |
| 1901 | 91.167 |
| 1902 | 91.167 |
| 1903 | 91.167 |
| 1904 | 91 |
| 1905 | 91 |
| 1906 | 91.167 |
| 1907 | 91.167 |
| 1908 | 91 |
| 1909 | 90.833 |
| 1910 | 90.5 |
| 1911 | 90.5 |
| 1912 | 90.5 |
| 1913 | 90.5 |
| 1914 | 90.833 |
| 1915 | 90.667 |
| 1916 | 91.167 |
| 1917 | 91.333 |
| 1918 | 91.5 |
| 1919 | 91.5 |
| 1920 | 92.167 |
| 1921 | 92.167 |
| 1922 | 92 |
| 1923 | 91.833 |
| 1924 | 92 |
| 1925 | 91.833 |
| 1926 | 91.833 |
| 1927 | 91.833 |
| 1928 | 91.833 |
| 1929 | 91.833 |
| 1930 | 91.833 |
| 1931 | 91.333 |
| 1932 | 91.167 |
| 1933 | 91 |
| 1934 | 91 |
| 1935 | 91 |
| 1936 | 91 |
| 1937 | 90.833 |
| 1938 | 90.333 |
| 1939 | 90.333 |
| 1940 | 90 |
| 1941 | 89.833 |
| 1942 | 90 |
| 1943 | 90 |
| 1944 | 90.5 |
| 1945 | 90.667 |
| 1946 | 91 |
| 1947 | 91.667 |
| 1948 | 91.667 |
| 1949 | 91.833 |
| 1950 | 91.833 |
| 1951 | 91.5 |
| 1952 | 91.5 |
| 1953 | 90.833 |
| 1954 | 90.833 |
| 1955 | 90.5 |
| 1956 | 90.5 |
| 1957 | 90.333 |
| 1958 | 90.333 |
| 1959 | 90.333 |
| 1960 | 90.5 |
| 1961 | 90.167 |
| 1962 | 90.167 |
| 1963 | 90.167 |
| 1964 | 90.167 |
| 1965 | 90.167 |
| 1966 | 90.167 |
| 1967 | 90.333 |
| 1968 | 90.5 |
| 1969 | 90.5 |
| 1970 | 90.667 |
| 1971 | 91.167 |
| 1972 | 91.167 |
| 1973 | 91.667 |
| 1974 | 91.667 |
| 1975 | 92 |
| 1976 | 92 |
| 1977 | 92 |
| 1978 | 91.833 |
| 1979 | 91.333 |
| 1980 | 91.333 |
| 1981 | 91 |
| 1982 | 90.833 |
| 1983 | 90.667 |
| 1984 | 90.667 |
| 1985 | 90.667 |
| 1986 | 90.5 |
| 1987 | 90.5 |
| 1988 | 90.5 |
| 1989 | 90.333 |
| 1990 | 90.333 |
| 1991 | 90 |
| 1992 | 90 |
| 1993 | 90 |
| 1994 | 90 |
| 1995 | 90.167 |
| 1996 | 90.167 |
| 1997 | 90.5 |
| 1998 | 90.5 |
| 1999 | 91 |
| 2000 | 91.167 |
| 2001 | 91.5 |
| 2002 | 91.5 |
| 2003 | 91.667 |
| 2004 | 91.667 |
| 2005 | 91.333 |
| 2006 | 91.333 |
| 2007 | 90.833 |
| 2008 | 90.667 |
| 2009 | 90.5 |
| 2010 | 90.5 |
| 2011 | 90.167 |
| 2012 | 90.167 |
| 2013 | 90.167 |
| 2014 | 90.167 |
| 2015 | 90 |
| 2016 | 90 |
| 2017 | 90.167 |
| 2018 | 90.333 |
| 2019 | 90.833 |
| 2020 | 90.833 |
| 2021 | 91.167 |
| 2022 | 91.167 |
| 2023 | 91.167 |
| 2024 | 91.167 |
| 2025 | 91 |
| 2026 | 90.833 |
| 2027 | 91 |
| 2028 | 90.833 |
| 2029 | 90.667 |
| 2030 | 90.667 |
| 2031 | 90.667 |
| 2032 | 90.667 |
| 2033 | 90.667 |
| 2034 | 91 |
| 2035 | 91.667 |
| 2036 | 92 |
| 2037 | 92.333 |
| 2038 | 92.5 |
| 2039 | 93.333 |
| 2040 | 93.5 |
| 2041 | 94 |
| 2042 | 94.333 |
| 2043 | 94.5 |
| 2044 | 94.667 |
| 2045 | 94.667 |
| 2046 | 94.5 |
| 2047 | 94.5 |
| 2048 | 94 |
| 2049 | 93.833 |
| 2050 | 92.833 |
| 2051 | 92.833 |
| 2052 | 91.833 |
| 2053 | 91.833 |
| 2054 | 91.5 |
| 2055 | 91.333 |
| 2056 | 90.667 |
| 2057 | 90.667 |
| 2058 | 90.333 |
| 2059 | 90.333 |
| 2060 | 90.833 |
| 2061 | 90.833 |
| 2062 | 91.167 |
| 2063 | 91.167 |
| 2064 | 91.167 |
| 2065 | 91.167 |
| 2066 | 91.167 |
| 2067 | 91.167 |
| 2068 | 91.333 |
| 2069 | 91.333 |
| 2070 | 91.667 |
| 2071 | 91.667 |
| 2072 | 92.167 |
| 2073 | 92.333 |
| 2074 | 92.333 |
| 2075 | 92.5 |
| 2076 | 92.5 |
| 2077 | 92.5 |
| 2078 | 92.5 |
| 2079 | 92.5 |
| 2080 | 92.333 |
| 2081 | 91.833 |
| 2082 | 91.833 |
| 2083 | 91.667 |
| 2084 | 91.667 |
| 2085 | 91.5 |
| 2086 | 91.333 |
| 2087 | 90.833 |
| 2088 | 91 |
| 2089 | 91.333 |
| 2090 | 91.167 |
| 2091 | 90.833 |
| 2092 | 90.833 |
| 2093 | 90.333 |
| 2094 | 90.333 |
| 2095 | 90.167 |
| 2096 | 90.167 |
| 2097 | 90 |
| 2098 | 90 |
| 2099 | 89.833 |
| 2100 | 89.667 |
| 2101 | 89.667 |
| 2102 | 89.5 |
| 2103 | 89.5 |
| 2104 | 89.333 |
| 2105 | 89.167 |
| 2106 | 89.167 |
| 2107 | 88.833 |
| 2108 | 88.833 |
| 2109 | 88.5 |
| 2110 | 88.5 |
| 2111 | 88.5 |
| 2112 | 88.333 |
| 2113 | 88.167 |
| 2114 | 88.333 |
| 2115 | 88.333 |
| 2116 | 88.5 |
| 2117 | 88.5 |
| 2118 | 88.833 |
| 2119 | 89 |
| 2120 | 89.333 |
| 2121 | 89.333 |
| 2122 | 90 |
| 2123 | 90 |
| 2124 | 90.167 |
| 2125 | 90.167 |
| 2126 | 90.5 |
| 2127 | 90.667 |
| 2128 | 91 |
| 2129 | 91 |
| 2130 | 91.667 |
| 2131 | 91.667 |
| 2132 | 92.333 |
| 2133 | 92.5 |
| 2134 | 93 |
| 2135 | 93 |
| 2136 | 93.333 |
| 2137 | 93.333 |
| 2138 | 93.5 |
| 2139 | 93.5 |
| 2140 | 93.667 |
| 2141 | 93.5 |
| 2142 | 93.167 |
| 2143 | 93 |
| 2144 | 93 |
| 2145 | 93 |
| 2146 | 93 |
| 2147 | 93 |
| 2148 | 92.333 |
| 2149 | 92.167 |
| 2150 | 92 |
| 2151 | 92 |
| 2152 | 92 |
| 2153 | 92.167 |
| 2154 | 92.167 |
| 2155 | 92.167 |
| 2156 | 92.333 |
| 2157 | 92.333 |
| 2158 | 92.333 |
| 2159 | 92.333 |
| 2160 | 92.333 |
| 2161 | 92.5 |
| 2162 | 92.5 |
| 2163 | 92.5 |
| 2164 | 92.5 |
| 2165 | 92.5 |
| 2166 | 92.667 |
| 2167 | 92.667 |
| 2168 | 92.333 |
| 2169 | 92.167 |
| 2170 | 91.833 |
| 2171 | 91.5 |
| 2172 | 91.5 |
| 2173 | 91.667 |
| 2174 | 91.667 |
| 2175 | 90.833 |
| 2176 | 91 |
| 2177 | 90.5 |
| 2178 | 90.5 |
| 2179 | 90.5 |
| 2180 | 90.5 |
| 2181 | 91.167 |
| 2182 | 91.333 |
| 2183 | 92.167 |
| 2184 | 92.333 |
| 2185 | 93 |
| 2186 | 93.167 |
| 2187 | 93.333 |
| 2188 | 93.333 |
| 2189 | 93.5 |
| 2190 | 93.5 |
| 2191 | 93.833 |
| 2192 | 93.833 |
| 2193 | 93.667 |
| 2194 | 93.833 |
| 2195 | 93.833 |
| 2196 | 93.833 |
| 2197 | 93.833 |
| 2198 | 93.667 |
| 2199 | 93.5 |
| 2200 | 93.167 |
| 2201 | 93.167 |
| 2202 | 92.333 |
| 2203 | 92.333 |
| 2204 | 91.667 |
| 2205 | 91.667 |
| 2206 | 91.333 |
| 2207 | 91.333 |
| 2208 | 91 |
| 2209 | 91 |
| 2210 | 91 |
| 2211 | 91.333 |
| 2212 | 91.5 |
| 2213 | 91.167 |
| 2214 | 91 |
| 2215 | 90.5 |
| 2216 | 90.5 |
| 2217 | 90 |
| 2218 | 90 |
| 2219 | 89.667 |
| 2220 | 89.833 |
| 2221 | 89.5 |
| 2222 | 89.5 |
| 2223 | 89.333 |
| 2224 | 89.333 |
| 2225 | 89.167 |
| 2226 | 89.167 |
| 2227 | 89 |
| 2228 | 89 |
| 2229 | 88.833 |
| 2230 | 88.833 |
| 2231 | 88.667 |
| 2232 | 88.833 |
| 2233 | 88.833 |
| 2234 | 88.833 |
| 2235 | 88.833 |
| 2236 | 88.833 |
| 2237 | 89 |
| 2238 | 89 |
| 2239 | 89.167 |
| 2240 | 89.333 |
| 2241 | 89.5 |
| 2242 | 89.333 |
| 2243 | 89.667 |
| 2244 | 89.833 |
| 2245 | 90.667 |
| 2246 | 90.667 |
| 2247 | 91 |
| 2248 | 91.167 |
| 2249 | 91.667 |
| 2250 | 91.667 |
| 2251 | 92 |
| 2252 | 92 |
| 2253 | 92.333 |
| 2254 | 92.333 |
| 2255 | 92.333 |
| 2256 | 92.333 |
| 2257 | 92.5 |
| 2258 | 92.5 |
| 2259 | 92.333 |
| 2260 | 92.167 |
| 2261 | 92.333 |
| 2262 | 92.333 |
| 2263 | 92.667 |
| 2264 | 92.667 |
| 2265 | 92.667 |
| 2266 | 92.667 |
| 2267 | 92.667 |
| 2268 | 92.667 |
| 2269 | 92.667 |
| 2270 | 92.5 |
| 2271 | 92.5 |
| 2272 | 92.5 |
| 2273 | 92.333 |
| 2274 | 92.333 |
| 2275 | 92.167 |
| 2276 | 92.167 |
| 2277 | 92 |
| 2278 | 92 |
| 2279 | 92 |
| 2280 | 92 |
| 2281 | 91.833 |
| 2282 | 91.833 |
| 2283 | 91.333 |
| 2284 | 91.333 |
| 2285 | 91.833 |
| 2286 | 91.833 |
| 2287 | 92.333 |
| 2288 | 92.333 |
| 2289 | 92.333 |
| 2290 | 92.333 |
| 2291 | 92 |
| 2292 | 92 |
| 2293 | 92.167 |
| 2294 | 92.167 |
| 2295 | 92.167 |
| 2296 | 92 |
| 2297 | 91.833 |
| 2298 | 91.833 |
| 2299 | 91.333 |
| 2300 | 91.333 |
| 2301 | 91.333 |
| 2302 | 91.333 |
| 2303 | 91.167 |
| 2304 | 91.167 |
| 2305 | 91.167 |
| 2306 | 91.167 |
| 2307 | 91.5 |
| 2308 | 91.5 |
| 2309 | 91.167 |
| 2310 | 91.167 |
| 2311 | 90.5 |
| 2312 | 90.5 |
| 2313 | 89.833 |
| 2314 | 89.833 |
| 2315 | 89.667 |
| 2316 | 89.667 |
| 2317 | 89.833 |
| 2318 | 89.833 |
| 2319 | 90 |
| 2320 | 90 |
| 2321 | 90.333 |
| 2322 | 90.5 |
| 2323 | 90.5 |
| 2324 | 90.5 |
| 2325 | 90.5 |
| 2326 | 90.667 |
| 2327 | 90.667 |
| 2328 | 90.5 |
| 2329 | 90.5 |
| 2330 | 90.5 |
| 2331 | 90.167 |
| 2332 | 90.333 |
| 2333 | 90.5 |
| 2334 | 90.5 |
| 2335 | 90.5 |
| 2336 | 90.167 |
| 2337 | 90.167 |
| 2338 | 90.333 |
| 2339 | 90.333 |
| 2340 | 90.333 |
| 2341 | 90.667 |
| 2342 | 90.667 |
| 2343 | 91 |
| 2344 | 91 |
| 2345 | 91.167 |
| 2346 | 91.167 |
| 2347 | 91.167 |
| 2348 | 91.167 |
| 2349 | 90.833 |
| 2350 | 90.667 |
| 2351 | 90.667 |
| 2352 | 90.5 |
| 2353 | 90.333 |
| 2354 | 90.5 |
| 2355 | 90.667 |
| 2356 | 90.667 |
| 2357 | 90.5 |
| 2358 | 90.333 |
| 2359 | 90.167 |
| 2360 | 90.167 |
| 2361 | 90.167 |
| 2362 | 90.167 |
| 2363 | 90.5 |
| 2364 | 90.333 |
| 2365 | 90.833 |
| 2366 | 90.833 |
| 2367 | 91 |
| 2368 | 91 |
| 2369 | 91 |
| 2370 | 90.833 |
| 2371 | 90.667 |
| 2372 | 91 |
| 2373 | 91 |
| 2374 | 91.333 |
| 2375 | 91.333 |
| 2376 | 91.667 |
| 2377 | 91.5 |
| 2378 | 91.333 |
| 2379 | 91.5 |
| 2380 | 91.833 |
| 2381 | 92 |
| 2382 | 92.5 |
| 2383 | 92.667 |
| 2384 | 92.833 |
| 2385 | 92.833 |
| 2386 | 92.667 |
| 2387 | 91.833 |
| 2388 | 91.667 |
| 2389 | 91.5 |
| 2390 | 91.167 |
| 2391 | 90.667 |
| 2392 | 90.5 |
| 2393 | 90 |
| 2394 | 90 |
| 2395 | 89.833 |
| 2396 | 89.833 |
| 2397 | 89.833 |
| 2398 | 89.833 |
| 2399 | 90 |
| 2400 | 90 |
| 2401 | 90.167 |
| 2402 | 90.333 |
| 2403 | 90.5 |
| 2404 | 90.5 |
| 2405 | 90.833 |
| 2406 | 90.833 |
| 2407 | 91 |
| 2408 | 91 |
| 2409 | 91 |
| 2410 | 90.833 |
| 2411 | 90.833 |
| 2412 | 90.833 |
| 2413 | 91.167 |
| 2414 | 91.167 |
| 2415 | 91.667 |
| 2416 | 91.667 |
| 2417 | 91.833 |
| 2418 | 92 |
| 2419 | 92.167 |
| 2420 | 92.167 |
| 2421 | 92.167 |
| 2422 | 92.167 |
| 2423 | 91.667 |
| 2424 | 91.667 |
| 2425 | 91.167 |
| 2426 | 91.167 |
| 2427 | 91 |
| 2428 | 91 |
| 2429 | 90.833 |
| 2430 | 90.833 |
| 2431 | 90.833 |
| 2432 | 91 |
| 2433 | 91 |
| 2434 | 91 |
| 2435 | 91.333 |
| 2436 | 91.333 |
| 2437 | 91.167 |
| 2438 | 91.167 |
| 2439 | 91.5 |
| 2440 | 91.5 |
| 2441 | 92.167 |
| 2442 | 92.167 |
| 2443 | 92.333 |
| 2444 | 92.333 |
| 2445 | 92.333 |
| 2446 | 92.167 |
| 2447 | 92.167 |
| 2448 | 92.167 |
| 2449 | 92.167 |
| 2450 | 92 |
| 2451 | 91.833 |
| 2452 | 91.833 |
| 2453 | 91.833 |
| 2454 | 91.833 |
| 2455 | 91.667 |
| 2456 | 91.833 |
| 2457 | 91.833 |
| 2458 | 91.833 |
| 2459 | 91.667 |
| 2460 | 91.5 |
| 2461 | 91.5 |
| 2462 | 91.333 |
| 2463 | 91.5 |
| 2464 | 91.333 |
| 2465 | 91.5 |
| 2466 | 91.5 |
| 2467 | 91.667 |
| 2468 | 91.667 |
| 2469 | 91.833 |
| 2470 | 91.667 |
| 2471 | 91.5 |
| 2472 | 91.5 |
| 2473 | 91.333 |
| 2474 | 91.333 |
| 2475 | 91.333 |
| 2476 | 91.167 |
| 2477 | 90.833 |
| 2478 | 90.667 |
| 2479 | 90.833 |
| 2480 | 90.833 |
| 2481 | 90.5 |
| 2482 | 90.333 |
| 2483 | 90.333 |
| 2484 | 90.333 |
| 2485 | 90.333 |
| 2486 | 90.333 |
| 2487 | 90.333 |
| 2488 | 90.333 |
| 2489 | 90.667 |
| 2490 | 90.833 |
| 2491 | 91.167 |
| 2492 | 91.167 |
| 2493 | 91.333 |
| 2494 | 91.333 |
| 2495 | 91.167 |
| 2496 | 91.167 |
| 2497 | 91.333 |
| 2498 | 91.333 |
| 2499 | 91.5 |
| 2500 | 91.667 |
| 2501 | 91.833 |
| 2502 | 91.833 |
| 2503 | 91.667 |
| 2504 | 91.667 |
| 2505 | 91.833 |
| 2506 | 91.833 |
| 2507 | 91.667 |
| 2508 | 91.667 |
| 2509 | 91.667 |
| 2510 | 91.5 |
| 2511 | 91.5 |
| 2512 | 91.833 |
| 2513 | 91.833 |
| 2514 | 91.833 |
| 2515 | 91.667 |
| 2516 | 91.5 |
| 2517 | 91.667 |
| 2518 | 91.667 |
| 2519 | 91.667 |
| 2520 | 91.833 |
| 2521 | 91.833 |
| 2522 | 92 |
| 2523 | 91.833 |
| 2524 | 92 |
| 2525 | 92 |
| 2526 | 92.167 |
| 2527 | 92.167 |
| 2528 | 92.333 |
| 2529 | 92.333 |
| 2530 | 92.167 |
| 2531 | 92.167 |
| 2532 | 92.167 |
| 2533 | 92.167 |
| 2534 | 92 |
| 2535 | 92 |
| 2536 | 91.667 |
| 2537 | 91.5 |
| 2538 | 91.5 |
| 2539 | 91.333 |
| 2540 | 91.333 |
| 2541 | 91.333 |
| 2542 | 91.333 |
| 2543 | 91.667 |
| 2544 | 91.833 |
| 2545 | 92 |
| 2546 | 91.833 |
| 2547 | 91.833 |
| 2548 | 92 |
| 2549 | 92 |
| 2550 | 91.833 |
| 2551 | 92 |
| 2552 | 92 |
| 2553 | 92 |
| 2554 | 92 |
| 2555 | 92 |
| 2556 | 91.833 |
| 2557 | 91.667 |
| 2558 | 91.333 |
| 2559 | 91.333 |
| 2560 | 90.833 |
| 2561 | 91 |
| 2562 | 90.833 |
| 2563 | 90.833 |
| 2564 | 90.833 |
| 2565 | 90.667 |
| 2566 | 90.5 |
| 2567 | 90.5 |
| 2568 | 90.333 |
| 2569 | 90.333 |
| 2570 | 90.167 |
| 2571 | 90.167 |
| 2572 | 90.333 |
| 2573 | 90.333 |
| 2574 | 90.167 |
| 2575 | 90.333 |
| 2576 | 90.167 |
| 2577 | 90.167 |
| 2578 | 90 |
| 2579 | 90 |
| 2580 | 89.833 |
| 2581 | 89.833 |
| 2582 | 90 |
| 2583 | 90 |
| 2584 | 90 |
| 2585 | 90 |
| 2586 | 89.833 |
| 2587 | 89.833 |
| 2588 | 89.833 |
| 2589 | 89.667 |
| 2590 | 90 |
| 2591 | 90.167 |
| 2592 | 90.167 |
| 2593 | 90.333 |
| 2594 | 90.333 |
| 2595 | 90.333 |
| 2596 | 90.833 |
| 2597 | 90.667 |
| 2598 | 91.167 |
| 2599 | 91.167 |
| 2600 | 91.5 |
| 2601 | 91.333 |
| 2602 | 91.333 |
| 2603 | 91.333 |
| 2604 | 91.5 |
| 2605 | 91.5 |
| 2606 | 91.333 |
| 2607 | 91.333 |
| 2608 | 91.5 |
| 2609 | 91.5 |
| 2610 | 91.833 |
| 2611 | 92 |
| 2612 | 92.333 |
| 2613 | 92.333 |
| 2614 | 92.5 |
| 2615 | 92.5 |
| 2616 | 92.667 |
| 2617 | 92.833 |
| 2618 | 93 |
| 2619 | 93.167 |
| 2620 | 93.5 |
| 2621 | 93.5 |
| 2622 | 93.833 |
| 2623 | 93.833 |
| 2624 | 93.667 |
| 2625 | 93.5 |
| 2626 | 93.333 |
| 2627 | 93.333 |
| 2628 | 93.333 |
| 2629 | 93.333 |
| 2630 | 93.167 |
| 2631 | 93.333 |
| 2632 | 93 |
| 2633 | 92.833 |
| 2634 | 92.833 |
| 2635 | 92.833 |
| 2636 | 92.5 |
| 2637 | 92.333 |
| 2638 | 92.167 |
| 2639 | 92.167 |
| 2640 | 92 |
| 2641 | 92 |
| 2642 | 92.167 |
| 2643 | 92.167 |
| 2644 | 92.5 |
| 2645 | 92.5 |
| 2646 | 92.333 |
| 2647 | 92.5 |
| 2648 | 92.5 |
| 2649 | 92.5 |
| 2650 | 92.5 |
| 2651 | 92.667 |
| 2652 | 92.833 |
| 2653 | 92.833 |
| 2654 | 93.167 |
| 2655 | 93.167 |
| 2656 | 93.333 |
| 2657 | 93.5 |
| 2658 | 93.5 |
| 2659 | 93.5 |
| 2660 | 93.167 |
| 2661 | 93 |
| 2662 | 92.5 |
| 2663 | 92.333 |
| 2664 | 92 |
| 2665 | 91.667 |
| 2666 | 91.5 |
| 2667 | 90.667 |
| 2668 | 90.667 |
| 2669 | 90.667 |
| 2670 | 90.667 |
| 2671 | 90.333 |
| 2672 | 90.333 |
| 2673 | 89.667 |
| 2674 | 89.667 |
| 2675 | 89.5 |
| 2676 | 89.5 |
| 2677 | 89.5 |
| 2678 | 89.5 |
| 2679 | 90 |
| 2680 | 90 |
| 2681 | 90 |
| 2682 | 90 |
| 2683 | 90 |
| 2684 | 90 |
| 2685 | 90.333 |
| 2686 | 90.333 |
| 2687 | 90.667 |
| 2688 | 90.833 |
| 2689 | 91.333 |
| 2690 | 91.333 |
| 2691 | 91.667 |
| 2692 | 91.5 |
| 2693 | 91.833 |
| 2694 | 91.833 |
| 2695 | 92 |
| 2696 | 92 |
| 2697 | 92.167 |
| 2698 | 92.167 |
| 2699 | 92.167 |
| 2700 | 92.167 |
| 2701 | 91.167 |
| 2702 | 91 |
| 2703 | 90.333 |
| 2704 | 90.167 |
| 2705 | 89.5 |
| 2706 | 89.5 |
| 2707 | 89.167 |
| 2708 | 89.167 |
| 2709 | 89.167 |
| 2710 | 89.167 |
| 2711 | 89.333 |
| 2712 | 89.333 |
| 2713 | 89.5 |
| 2714 | 89.5 |
| 2715 | 89.667 |
| 2716 | 89.667 |
| 2717 | 89.667 |
| 2718 | 89.667 |
| 2719 | 89.5 |
| 2720 | 89.5 |
| 2721 | 89.5 |
| 2722 | 89.5 |
| 2723 | 89.333 |
| 2724 | 89.333 |
| 2725 | 89.167 |
| 2726 | 89.333 |
| 2727 | 89.333 |
| 2728 | 89.5 |
| 2729 | 89.833 |
| 2730 | 89.833 |
| 2731 | 90 |
| 2732 | 90.167 |
| 2733 | 90.5 |
| 2734 | 90.5 |
| 2735 | 91.667 |
| 2736 | 91.833 |
| 2737 | 92 |
| 2738 | 92 |
| 2739 | 92.167 |
| 2740 | 92.167 |
| 2741 | 91.833 |
| 2742 | 91.833 |
| 2743 | 91.667 |
| 2744 | 91.667 |
| 2745 | 91.667 |
| 2746 | 91.667 |
| 2747 | 91.167 |
| 2748 | 91.167 |
| 2749 | 91 |
| 2750 | 91.167 |
| 2751 | 91 |
| 2752 | 91 |
| 2753 | 91 |
| 2754 | 91.167 |
| 2755 | 91.5 |
| 2756 | 91.667 |
| 2757 | 92.167 |
| 2758 | 92.167 |
| 2759 | 92.833 |
| 2760 | 92.833 |
| 2761 | 92.833 |
| 2762 | 92.667 |
| 2763 | 91.833 |
| 2764 | 91.667 |
| 2765 | 90.667 |
| 2766 | 90.667 |
| 2767 | 90 |
| 2768 | 90 |
| 2769 | 90.167 |
| 2770 | 90.167 |
| 2771 | 90.5 |
| 2772 | 90.5 |
| 2773 | 90.833 |
| 2774 | 90.833 |
| 2775 | 91 |
| 2776 | 91 |
| 2777 | 91.333 |
| 2778 | 91.5 |
| 2779 | 91.833 |
| 2780 | 92 |
| 2781 | 92.167 |
| 2782 | 92.333 |
| 2783 | 92.5 |
| 2784 | 92.5 |
| 2785 | 92.5 |
| 2786 | 92.5 |
| 2787 | 92.667 |
| 2788 | 92.667 |
| 2789 | 92.333 |
| 2790 | 92.333 |
| 2791 | 92.667 |
| 2792 | 92.667 |
| 2793 | 93.167 |
| 2794 | 93.167 |
| 2795 | 93 |
| 2796 | 93 |
| 2797 | 92.667 |
| 2798 | 92.667 |
| 2799 | 92.5 |
| 2800 | 92.333 |
| 2801 | 92.333 |
| 2802 | 92.333 |
| 2803 | 92.167 |
| 2804 | 92.333 |
| 2805 | 92.167 |
| 2806 | 92.167 |
| 2807 | 91.667 |
| 2808 | 91.667 |
| 2809 | 91.167 |
| 2810 | 91 |
| 2811 | 90.5 |
| 2812 | 90.5 |
| 2813 | 90.333 |
| 2814 | 90.333 |
| 2815 | 90.333 |
| 2816 | 90.5 |
| 2817 | 90.5 |
| 2818 | 91.333 |
| 2819 | 91.5 |
| 2820 | 92.5 |
| 2821 | 92.5 |
| 2822 | 93.333 |
| 2823 | 93.5 |
| 2824 | 94.333 |
| 2825 | 94.5 |
| 2826 | 94.667 |
| 2827 | 94.667 |
| 2828 | 94.833 |
| 2829 | 94.667 |
| 2830 | 93.833 |
| 2831 | 93.833 |
| 2832 | 93.333 |
| 2833 | 92.833 |
| 2834 | 92.5 |
| 2835 | 91.833 |
| 2836 | 91.5 |
| 2837 | 91.333 |
| 2838 | 91.5 |
| 2839 | 91.5 |
| 2840 | 91.5 |
| 2841 | 91.5 |
| 2842 | 91 |
| 2843 | 91 |
| 2844 | 90.667 |
| 2845 | 90.667 |
| 2846 | 90.833 |
| 2847 | 90.833 |
| 2848 | 90.667 |
| 2849 | 90.667 |
| 2850 | 90.667 |
| 2851 | 90.667 |
| 2852 | 90.667 |
| 2853 | 90.667 |
| 2854 | 90.5 |
| 2855 | 90.333 |
| 2856 | 90.333 |
| 2857 | 90.167 |
| 2858 | 90.167 |
| 2859 | 90.167 |
| 2860 | 90.167 |
| 2861 | 90 |
| 2862 | 90 |
| 2863 | 89.833 |
| 2864 | 89.667 |
| 2865 | 89.5 |
| 2866 | 89.333 |
| 2867 | 89 |
| 2868 | 89 |
| 2869 | 89 |
| 2870 | 89 |
| 2871 | 89 |
| 2872 | 89 |
| 2873 | 88.833 |
| 2874 | 88.833 |
| 2875 | 88.833 |
| 2876 | 89 |
| 2877 | 89.167 |
| 2878 | 89.167 |
| 2879 | 89.5 |
| 2880 | 89.667 |
| 2881 | 89.833 |
| 2882 | 89.833 |
| 2883 | 90.167 |
| 2884 | 90.333 |
| 2885 | 90.667 |
| 2886 | 90.667 |
| 2887 | 91 |
| 2888 | 91 |
| 2889 | 91.333 |
| 2890 | 91.333 |
| 2891 | 91.5 |
| 2892 | 91.5 |
| 2893 | 91.5 |
| 2894 | 91.333 |
| 2895 | 91 |
| 2896 | 91 |
| 2897 | 90.667 |
| 2898 | 90.5 |
| 2899 | 90.667 |
| 2900 | 90.5 |
| 2901 | 91 |
| 2902 | 91 |
| 2903 | 90.667 |
| 2904 | 90.667 |
| 2905 | 90.667 |
| 2906 | 90.667 |
| 2907 | 90.5 |
| 2908 | 90.5 |
| 2909 | 90.5 |
| 2910 | 90.5 |
| 2911 | 90.667 |
| 2912 | 90.833 |
| 2913 | 91 |
| 2914 | 91.167 |
| 2915 | 91.5 |
| 2916 | 91.667 |
| 2917 | 91.667 |
| 2918 | 91.667 |
| 2919 | 91.667 |
| 2920 | 91.667 |
| 2921 | 91.667 |
| 2922 | 91.667 |
| 2923 | 91.667 |
| 2924 | 91.667 |
| 2925 | 91.667 |
| 2926 | 91.5 |
| 2927 | 91.667 |
| 2928 | 91.833 |
| 2929 | 91.833 |
| 2930 | 91.833 |
| 2931 | 91.833 |
| 2932 | 91.833 |
| 2933 | 91.833 |
| 2934 | 91.833 |
| 2935 | 91.833 |
| 2936 | 91.5 |
| 2937 | 91.5 |
| 2938 | 91.167 |
| 2939 | 91 |
| 2940 | 90.5 |
| 2941 | 90.5 |
| 2942 | 90.333 |
| 2943 | 90.5 |
| 2944 | 90.5 |
| 2945 | 90.5 |
| 2946 | 90.667 |
| 2947 | 90.667 |
| 2948 | 90.667 |
| 2949 | 90.667 |
| 2950 | 90.667 |
| 2951 | 90.667 |
| 2952 | 90.833 |
| 2953 | 90.833 |
| 2954 | 90.833 |
| 2955 | 90.833 |
| 2956 | 91.333 |
| 2957 | 91.333 |
| 2958 | 91.667 |
| 2959 | 91.833 |
| 2960 | 92 |
| 2961 | 92 |
| 2962 | 92.333 |
| 2963 | 92.5 |
| 2964 | 93 |
| 2965 | 93 |
| 2966 | 93.333 |
| 2967 | 93.5 |
| 2968 | 93.5 |
| 2969 | 93.333 |
| 2970 | 93.333 |
| 2971 | 93.167 |
| 2972 | 93.167 |
| 2973 | 93.167 |
| 2974 | 93.167 |
| 2975 | 93 |
| 2976 | 93 |
| 2977 | 92.833 |
| 2978 | 92.833 |
| 2979 | 93.667 |
| 2980 | 93.667 |
| 2981 | 94.333 |
| 2982 | 94.333 |
| 2983 | 94.5 |
| 2984 | 94.667 |
| 2985 | 94.833 |
| 2986 | 95 |
| 2987 | 95.167 |
| 2988 | 95.333 |
| 2989 | 95.333 |
| 2990 | 95.5 |
| 2991 | 95.5 |
| 2992 | 95.5 |
| 2993 | 95.5 |
| 2994 | 95.167 |
| 2995 | 95.167 |
| 2996 | 94.667 |
| 2997 | 94.667 |
| 2998 | 93.833 |
| 2999 | 93.667 |
| 3000 | 93.333 |
| 3001 | 93.167 |
| 3002 | 92.5 |
| 3003 | 92.5 |
| 3004 | 92.167 |
| 3005 | 92.167 |
| 3006 | 92 |
| 3007 | 92 |
| 3008 | 91.333 |
| 3009 | 91.333 |
| 3010 | 91.167 |
| 3011 | 91 |
| 3012 | 91 |
| 3013 | 90.833 |
| 3014 | 90.833 |
| 3015 | 90.833 |
| 3016 | 91 |
| 3017 | 90.833 |
| 3018 | 90.5 |
| 3019 | 90.5 |
| 3020 | 90.333 |
| 3021 | 90.333 |
| 3022 | 90 |
| 3023 | 90 |
| 3024 | 89.833 |
| 3025 | 90 |
| 3026 | 89.833 |
| 3027 | 89.833 |
| 3028 | 89.833 |
| 3029 | 89.833 |
| 3030 | 89.833 |
| 3031 | 89.833 |
| 3032 | 90 |
| 3033 | 90 |
| 3034 | 90 |
| 3035 | 90 |
| 3036 | 90 |
| 3037 | 90 |
| 3038 | 89.833 |
| 3039 | 89.833 |
| 3040 | 89.667 |
| 3041 | 89.667 |
| 3042 | 89.5 |
| 3043 | 89.333 |
| 3044 | 89 |
| 3045 | 88.833 |
| 3046 | 88.833 |
| 3047 | 88.833 |
| 3048 | 88.667 |
| 3049 | 88.5 |
| 3050 | 88.333 |
| 3051 | 88.333 |
| 3052 | 88.333 |
| 3053 | 88.333 |
| 3054 | 88.333 |
| 3055 | 88.667 |
| 3056 | 88.667 |
| 3057 | 88.833 |
| 3058 | 88.833 |
| 3059 | 89 |
| 3060 | 89 |
| 3061 | 89.167 |
| 3062 | 89.167 |
| 3063 | 89.333 |
| 3064 | 89.333 |
| 3065 | 89.333 |
| 3066 | 89.333 |
| 3067 | 89.333 |
| 3068 | 89.333 |
| 3069 | 89 |
| 3070 | 89 |
| 3071 | 89 |
| 3072 | 89 |
| 3073 | 89 |
| 3074 | 89.167 |
| 3075 | 89.667 |
| 3076 | 90 |
| 3077 | 90.667 |
| 3078 | 91.167 |
| 3079 | 92 |
| 3080 | 92.667 |
| 3081 | 93.5 |
| 3082 | 93.667 |
| 3083 | 94.167 |
| 3084 | 94.667 |
| 3085 | 94.833 |
| 3086 | 95.333 |
| 3087 | 95.667 |
| 3088 | 96.167 |
| 3089 | 96.167 |
| 3090 | 96.167 |
| 3091 | 96.167 |
| 3092 | 96.167 |
| 3093 | 95.833 |
| 3094 | 95.667 |
| 3095 | 95.5 |
| 3096 | 95.333 |
| 3097 | 94.667 |
| 3098 | 94.667 |
| 3099 | 94.667 |
| 3100 | 94.667 |
| 3101 | 95 |
| 3102 | 95.167 |
| 3103 | 95.167 |
| 3104 | 95 |
| 3105 | 94.833 |
| 3106 | 94.667 |
| 3107 | 94.5 |
| 3108 | 94.5 |
| 3109 | 93.5 |
| 3110 | 93.333 |
| 3111 | 92.333 |
| 3112 | 92.167 |
| 3113 | 91.167 |
| 3114 | 91 |
| 3115 | 90.333 |
| 3116 | 90.333 |
| 3117 | 89.667 |
| 3118 | 89.667 |
| 3119 | 89.167 |
| 3120 | 89.167 |
| 3121 | 89.333 |
| 3122 | 89.5 |
| 3123 | 89.667 |
| 3124 | 89.833 |
| 3125 | 90 |
| 3126 | 90 |
| 3127 | 90.167 |
| 3128 | 90.333 |
| 3129 | 90.667 |
| 3130 | 90.833 |
| 3131 | 91.167 |
| 3132 | 91 |
| 3133 | 91.5 |
| 3134 | 91.833 |
| 3135 | 92.167 |
| 3136 | 92.167 |
| 3137 | 92.5 |
| 3138 | 92.5 |
| 3139 | 92.5 |
| 3140 | 92.5 |
| 3141 | 92.333 |
| 3142 | 92.333 |
| 3143 | 92.167 |
| 3144 | 92.167 |
| 3145 | 91.5 |
| 3146 | 91.5 |
| 3147 | 90.833 |
| 3148 | 90.667 |
| 3149 | 90.333 |
| 3150 | 90.333 |
| 3151 | 90.333 |
| 3152 | 90.333 |
| 3153 | 90.333 |
| 3154 | 90.333 |
| 3155 | 90.833 |
| 3156 | 90.833 |
| 3157 | 91 |
| 3158 | 91 |
| 3159 | 91.167 |
| 3160 | 91.167 |
| 3161 | 91.5 |
| 3162 | 91.5 |
| 3163 | 91.667 |
| 3164 | 91.667 |
| 3165 | 91.833 |
| 3166 | 91.833 |
| 3167 | 91.833 |
| 3168 | 91.667 |
| 3169 | 91.667 |
| 3170 | 91.667 |
| 3171 | 91 |
| 3172 | 91 |
| 3173 | 90.667 |
| 3174 | 90.5 |
| 3175 | 90 |
| 3176 | 90 |
| 3177 | 89.667 |
| 3178 | 89.667 |
| 3179 | 89.333 |
| 3180 | 89.333 |
| 3181 | 89.333 |
| 3182 | 89.333 |
| 3183 | 88.667 |
| 3184 | 88.5 |
| 3185 | 88.667 |
| 3186 | 88.5 |
| 3187 | 88.167 |
| 3188 | 88.167 |
| 3189 | 88.333 |
| 3190 | 88.333 |
| 3191 | 88.833 |
| 3192 | 88.833 |
| 3193 | 89.333 |
| 3194 | 89.167 |
| 3195 | 89.167 |
| 3196 | 89.167 |
| 3197 | 89.333 |
| 3198 | 89.5 |
| 3199 | 89.833 |
| 3200 | 90 |
| 3201 | 90.333 |
| 3202 | 90.167 |
| 3203 | 90.333 |
| 3204 | 90.333 |
| 3205 | 90.667 |
| 3206 | 90.833 |
| 3207 | 90.833 |
| 3208 | 90.833 |
| 3209 | 91 |
| 3210 | 91 |
| 3211 | 90.833 |
| 3212 | 91 |
| 3213 | 91 |
| 3214 | 90.833 |
| 3215 | 90.833 |
| 3216 | 90.833 |
| 3217 | 90.5 |
| 3218 | 90.5 |
| 3219 | 90.333 |
| 3220 | 90.5 |
| 3221 | 90.333 |
| 3222 | 90.333 |
| 3223 | 90.167 |
| 3224 | 90.167 |
| 3225 | 90 |
| 3226 | 90.167 |
| 3227 | 90 |
| 3228 | 89.833 |
| 3229 | 89.833 |
| 3230 | 89.833 |
| 3231 | 89.833 |
| 3232 | 90 |
| 3233 | 90.167 |
| 3234 | 90.167 |
| 3235 | 90.167 |
| 3236 | 90.167 |
| 3237 | 90.167 |
| 3238 | 90.167 |
| 3239 | 90.167 |
| 3240 | 90.333 |
| 3241 | 90 |
| 3242 | 90.167 |
| 3243 | 90.333 |
| 3244 | 90.167 |
| 3245 | 90.333 |
| 3246 | 90.5 |
| 3247 | 90.667 |
| 3248 | 90.667 |
| 3249 | 90.833 |
| 3250 | 91 |
| 3251 | 91 |
| 3252 | 91 |
| 3253 | 91.167 |
| 3254 | 91.167 |
| 3255 | 91.167 |
| 3256 | 91.167 |
| 3257 | 90.833 |
| 3258 | 90.833 |
| 3259 | 91.167 |
| 3260 | 91.5 |
| 3261 | 91.667 |
| 3262 | 92.5 |
| 3263 | 92.5 |
| 3264 | 93.667 |
| 3265 | 93.833 |
| 3266 | 94.833 |
| 3267 | 94.833 |
| 3268 | 95 |
| 3269 | 94.833 |
| 3270 | 94.667 |
| 3271 | 94.667 |
| 3272 | 94.5 |
| 3273 | 94.667 |
| 3274 | 94.667 |
| 3275 | 94.667 |
| 3276 | 94 |
| 3277 | 94 |
| 3278 | 93.333 |
| 3279 | 93.333 |
| 3280 | 93.667 |
| 3281 | 93.667 |
| 3282 | 94.333 |
| 3283 | 94.333 |
| 3284 | 94 |
| 3285 | 94 |
| 3286 | 93.333 |
| 3287 | 93.333 |
| 3288 | 92.667 |
| 3289 | 92.667 |
| 3290 | 92.667 |
| 3291 | 92.667 |
| 3292 | 92.333 |
| 3293 | 92.333 |
| 3294 | 92.667 |
| 3295 | 92.667 |
| 3296 | 93.333 |
| 3297 | 93.333 |
| 3298 | 93.667 |
| 3299 | 93.833 |
| 3300 | 94.167 |
| 3301 | 94.333 |
| 3302 | 94.333 |
| 3303 | 94.167 |
| 3304 | 94.333 |
| 3305 | 94 |
| 3306 | 94 |
| 3307 | 93.333 |
| 3308 | 93.167 |
| 3309 | 92.833 |
| 3310 | 92.833 |
| 3311 | 92.333 |
| 3312 | 92.333 |
| 3313 | 92.167 |
| 3314 | 92 |
| 3315 | 91.833 |
| 3316 | 91.667 |
| 3317 | 91.667 |
| 3318 | 91.833 |
| 3319 | 92.5 |
| 3320 | 92.5 |
| 3321 | 93 |
| 3322 | 93.167 |
| 3323 | 93.333 |
| 3324 | 93.333 |
| 3325 | 93.333 |
| 3326 | 93.333 |
| 3327 | 93 |
| 3328 | 92.833 |
| 3329 | 92.667 |
| 3330 | 92.667 |
| 3331 | 91.667 |
| 3332 | 91.667 |
| 3333 | 91 |
| 3334 | 91 |
| 3335 | 90.667 |
| 3336 | 90.667 |
| 3337 | 90.5 |
| 3338 | 90.333 |
| 3339 | 90 |
| 3340 | 89.833 |
| 3341 | 90 |
| 3342 | 90 |
| 3343 | 90.167 |
| 3344 | 90.167 |
| 3345 | 90.167 |
| 3346 | 90 |
| 3347 | 90 |
| 3348 | 90.167 |
| 3349 | 90.5 |
| 3350 | 90.5 |
| 3351 | 90.333 |
| 3352 | 90.333 |
| 3353 | 90.333 |
| 3354 | 90.167 |
| 3355 | 90 |
| 3356 | 90 |
| 3357 | 89.833 |
| 3358 | 89.667 |
| 3359 | 89.667 |
| 3360 | 89.833 |
| 3361 | 89.833 |
| 3362 | 89.833 |
| 3363 | 89.667 |
| 3364 | 89.667 |
| 3365 | 89.667 |
| 3366 | 89.667 |
| 3367 | 89.667 |
| 3368 | 89.833 |
| 3369 | 89.667 |
| 3370 | 89.667 |
| 3371 | 89.667 |
| 3372 | 89.5 |
| 3373 | 89.667 |
| 3374 | 89.667 |
| 3375 | 89.667 |
| 3376 | 89.667 |
| 3377 | 89.667 |
| 3378 | 89.667 |
| 3379 | 90 |
| 3380 | 90.167 |
| 3381 | 90.833 |
| 3382 | 91 |
| 3383 | 91.167 |
| 3384 | 91.167 |
| 3385 | 91.833 |
| 3386 | 92 |
| 3387 | 92.5 |
| 3388 | 92.5 |
| 3389 | 92.5 |
| 3390 | 92.5 |
| 3391 | 92.167 |
| 3392 | 92.167 |
| 3393 | 91.5 |
| 3394 | 91.5 |
| 3395 | 91.333 |
| 3396 | 91.333 |
| 3397 | 91.333 |
| 3398 | 91.333 |
| 3399 | 91.5 |
| 3400 | 91.5 |
| 3401 | 91.667 |
| 3402 | 91.833 |
| 3403 | 92.167 |
| 3404 | 92.167 |
| 3405 | 91.667 |
| 3406 | 91.833 |
| 3407 | 91.5 |
| 3408 | 91.5 |
| 3409 | 91.167 |
| 3410 | 91.167 |
| 3411 | 90.833 |
| 3412 | 90.833 |
| 3413 | 90.5 |
| 3414 | 90.333 |
| 3415 | 90.333 |
| 3416 | 90.333 |
| 3417 | 90.333 |
| 3418 | 90.167 |
| 3419 | 90 |
| 3420 | 89.833 |
| 3421 | 90 |
| 3422 | 89.833 |
| 3423 | 89.833 |
| 3424 | 90 |
| 3425 | 90 |
| 3426 | 90.667 |
| 3427 | 90.667 |
| 3428 | 91.5 |
| 3429 | 91.5 |
| 3430 | 92 |
| 3431 | 92 |
| 3432 | 92.333 |
| 3433 | 92.5 |
| 3434 | 92.333 |
| 3435 | 92.333 |
| 3436 | 92.333 |
| 3437 | 92.167 |
| 3438 | 91.833 |
| 3439 | 91.833 |
| 3440 | 91.667 |
| 3441 | 91.667 |
| 3442 | 91.5 |
| 3443 | 91.5 |
| 3444 | 91.167 |
| 3445 | 91.167 |
| 3446 | 90.833 |
| 3447 | 90.667 |
| 3448 | 90.333 |
| 3449 | 90.333 |
| 3450 | 90.333 |
| 3451 | 90.333 |
| 3452 | 89.667 |
| 3453 | 89.667 |
| 3454 | 89.333 |
| 3455 | 89.333 |
| 3456 | 89 |
| 3457 | 89 |
| 3458 | 89 |
| 3459 | 89 |
| 3460 | 89 |
| 3461 | 89.167 |
| 3462 | 89.167 |
| 3463 | 89 |
| 3464 | 89.167 |
| 3465 | 89.333 |
| 3466 | 89.833 |
| 3467 | 90 |
| 3468 | 90.833 |
| 3469 | 91 |
| 3470 | 91.333 |
| 3471 | 91.333 |
| 3472 | 92 |
| 3473 | 92 |
| 3474 | 92.667 |
| 3475 | 92.833 |
| 3476 | 93 |
| 3477 | 93 |
| 3478 | 93.5 |
| 3479 | 93.5 |
| 3480 | 94.167 |
| 3481 | 94.333 |
| 3482 | 94.5 |
| 3483 | 94.333 |
| 3484 | 94.667 |
| 3485 | 94.833 |
| 3486 | 95.333 |
| 3487 | 95.5 |
| 3488 | 95.667 |
| 3489 | 95.667 |
| 3490 | 95.333 |
| 3491 | 94.667 |
| 3492 | 94.5 |
| 3493 | 93.667 |
| 3494 | 93.5 |
| 3495 | 92.833 |
| 3496 | 92.833 |
| 3497 | 92.167 |
| 3498 | 92 |
| 3499 | 91.833 |
| 3500 | 91.833 |
| 3501 | 91.667 |
| 3502 | 91.667 |
| 3503 | 91.667 |
| 3504 | 91.333 |
| 3505 | 91.333 |
| 3506 | 91.5 |
| 3507 | 91.5 |
| 3508 | 91.5 |
| 3509 | 91.667 |
| 3510 | 91.667 |
| 3511 | 91.667 |
| 3512 | 91.167 |
| 3513 | 91.167 |
| 3514 | 90.5 |
| 3515 | 90.5 |
| 3516 | 90.167 |
| 3517 | 90.167 |
| 3518 | 90 |
| 3519 | 90 |
| 3520 | 90.167 |
| 3521 | 90.167 |
| 3522 | 90.167 |
| 3523 | 90.167 |
| 3524 | 90.167 |
| 3525 | 90 |
| 3526 | 90.167 |
| 3527 | 90.167 |
| 3528 | 90.167 |
| 3529 | 90.167 |
| 3530 | 90.5 |
| 3531 | 90.333 |
| 3532 | 90.667 |
| 3533 | 90.667 |
| 3534 | 91 |
| 3535 | 91.167 |
| 3536 | 92 |
| 3537 | 92.167 |
| 3538 | 93 |
| 3539 | 93.167 |
| 3540 | 93.333 |
| 3541 | 93.333 |
| 3542 | 93 |
| 3543 | 93 |
| 3544 | 93 |
| 3545 | 93 |
| 3546 | 93 |
| 3547 | 92.833 |
| 3548 | 92.333 |
| 3549 | 92 |
| 3550 | 91.833 |
| 3551 | 91.5 |
| 3552 | 91.333 |
| 3553 | 91.333 |
| 3554 | 91 |
| 3555 | 90.833 |
| 3556 | 90 |
| 3557 | 89.833 |
| 3558 | 89.167 |
| 3559 | 89.167 |
| 3560 | 89.167 |
| 3561 | 89.167 |
| 3562 | 89.333 |
| 3563 | 89.167 |
| 3564 | 89.333 |
| 3565 | 89.167 |
| 3566 | 89.167 |
| 3567 | 89.167 |
| 3568 | 89.333 |
| 3569 | 89.333 |
| 3570 | 89.667 |
| 3571 | 89.833 |
| 3572 | 90 |
| 3573 | 90 |
| 3574 | 89.833 |
| 3575 | 89.833 |
| 3576 | 89.667 |
| 3577 | 89.667 |
| 3578 | 89.5 |
| 3579 | 90 |
| 3580 | 90 |
| 3581 | 90.5 |
| 3582 | 90.5 |
| 3583 | 90.167 |
| 3584 | 90.167 |
| 3585 | 89.833 |
| 3586 | 90 |
| 3587 | 90.333 |
| 3588 | 90.5 |
| 3589 | 91.667 |
| 3590 | 91.833 |
| 3591 | 92.5 |
| 3592 | 92.333 |
| 3593 | 93 |
| 3594 | 93 |
| 3595 | 93.333 |
| 3596 | 93.333 |
| 3597 | 93.667 |
| 3598 | 93.833 |
| 3599 | 93.167 |
| 3600 | 93.167 |
| 3601 | 92.667 |
| 3602 | 92.667 |
| 3603 | 91.833 |
| 3604 | 91.667 |
| 3605 | 90.833 |
| 3606 | 90.667 |
| 3607 | 90.5 |
| 3608 | 90.5 |
| 3609 | 90.333 |
| 3610 | 90.333 |
| 3611 | 90.167 |
| 3612 | 90.167 |
| 3613 | 90.333 |
| 3614 | 90.167 |
| 3615 | 90.167 |
| 3616 | 90.167 |
| 3617 | 90.167 |
| 3618 | 90.167 |
| 3619 | 90.167 |
| 3620 | 90.167 |
| 3621 | 90.333 |
| 3622 | 90.5 |
| 3623 | 90.667 |
| 3624 | 90.667 |
| 3625 | 91 |
| 3626 | 91 |
| 3627 | 91.333 |
| 3628 | 91.5 |
| 3629 | 92.167 |
| 3630 | 92.167 |
| 3631 | 92.167 |
| 3632 | 92.167 |
| 3633 | 91.833 |
| 3634 | 91.667 |
| 3635 | 91.833 |
| 3636 | 91.833 |
| 3637 | 92.333 |
| 3638 | 92.5 |
| 3639 | 93 |
| 3640 | 92.833 |
| 3641 | 93 |
| 3642 | 93.167 |
| 3643 | 93 |
| 3644 | 93 |
| 3645 | 92.833 |
| 3646 | 92.833 |
| 3647 | 93 |
| 3648 | 93.333 |
| 3649 | 93.333 |
| 3650 | 93 |
| 3651 | 93 |
| 3652 | 92.833 |
| 3653 | 92.833 |
| 3654 | 92.833 |
| 3655 | 92.833 |
| 3656 | 93 |
| 3657 | 92.833 |
| 3658 | 92.333 |
| 3659 | 92.167 |
| 3660 | 91.667 |
| 3661 | 91.667 |
| 3662 | 91.5 |
| 3663 | 91.167 |
| 3664 | 91.167 |
| 3665 | 91 |
| 3666 | 91 |
| 3667 | 90.833 |
| 3668 | 90.833 |
| 3669 | 90.833 |
| 3670 | 90.833 |
| 3671 | 90.833 |
| 3672 | 91 |
| 3673 | 91 |
| 3674 | 91.167 |
| 3675 | 91.333 |
| 3676 | 91.333 |
| 3677 | 91.333 |
| 3678 | 91.5 |
| 3679 | 91.667 |
| 3680 | 92 |
| 3681 | 92.167 |
| 3682 | 92 |
| 3683 | 91.667 |
| 3684 | 91.667 |
| 3685 | 91.333 |
| 3686 | 91.167 |
| 3687 | 90.667 |
| 3688 | 90.5 |
| 3689 | 90 |
| 3690 | 90 |
| 3691 | 89.5 |
| 3692 | 89.5 |
| 3693 | 89.167 |
| 3694 | 88.833 |
| 3695 | 88.833 |
| 3696 | 88.667 |
| 3697 | 88.667 |
| 3698 | 88.5 |
| 3699 | 88.667 |
| 3700 | 88.667 |
| 3701 | 88.333 |
| 3702 | 88.5 |
| 3703 | 88.833 |
| 3704 | 89 |
| 3705 | 89.333 |
| 3706 | 89.333 |
| 3707 | 90 |
| 3708 | 90 |
| 3709 | 90.5 |
| 3710 | 90.667 |
| 3711 | 90.833 |
| 3712 | 91 |
| 3713 | 91 |
| 3714 | 91.667 |
| 3715 | 91.667 |
| 3716 | 92.167 |
| 3717 | 92.167 |
| 3718 | 92.5 |
| 3719 | 92.5 |
| 3720 | 92.5 |
| 3721 | 92.333 |
| 3722 | 92.667 |
| 3723 | 92.667 |
| 3724 | 92.667 |
| 3725 | 92.5 |
| 3726 | 92.5 |
| 3727 | 92.5 |
| 3728 | 92 |
| 3729 | 92 |
| 3730 | 92 |
| 3731 | 91.833 |
| 3732 | 91.333 |
| 3733 | 91.333 |
| 3734 | 91.333 |
| 3735 | 91.333 |
| 3736 | 91.667 |
| 3737 | 91.667 |
| 3738 | 92.167 |
| 3739 | 92 |
| 3740 | 92.333 |
| 3741 | 92.333 |
| 3742 | 93.167 |
| 3743 | 93.333 |
| 3744 | 93.667 |
| 3745 | 93.833 |
| 3746 | 93.667 |
| 3747 | 93.833 |
| 3748 | 93.667 |
| 3749 | 93.5 |
| 3750 | 93.667 |
| 3751 | 93.667 |
| 3752 | 93.5 |
| 3753 | 93.5 |
| 3754 | 93 |
| 3755 | 93 |
| 3756 | 92.5 |
| 3757 | 92.5 |
| 3758 | 92.333 |
| 3759 | 92.333 |
| 3760 | 92 |
| 3761 | 92.167 |
| 3762 | 92.167 |
| 3763 | 92.167 |
| 3764 | 92.167 |
| 3765 | 92.167 |
| 3766 | 92 |
| 3767 | 92 |
| 3768 | 91.833 |
| 3769 | 91.833 |
| 3770 | 92 |
| 3771 | 92 |
| 3772 | 92.667 |
| 3773 | 92.833 |
| 3774 | 93.167 |
| 3775 | 93.167 |
| 3776 | 93.167 |
| 3777 | 93.167 |
| 3778 | 92.333 |
| 3779 | 92.333 |
| 3780 | 91.5 |
| 3781 | 91.333 |
| 3782 | 90.667 |
| 3783 | 90.667 |
| 3784 | 90.167 |
| 3785 | 90 |
| 3786 | 89.333 |
| 3787 | 89.333 |
| 3788 | 89.5 |
| 3789 | 89.5 |
| 3790 | 89.333 |
| 3791 | 89.333 |
| 3792 | 89.5 |
| 3793 | 89.5 |
| 3794 | 89.167 |
| 3795 | 89.167 |
| 3796 | 89 |
| 3797 | 89 |
| 3798 | 88.333 |
| 3799 | 88.333 |
| 3800 | 88 |
| 3801 | 88.167 |
| 3802 | 88.667 |
| 3803 | 88.667 |
| 3804 | 88.167 |
| 3805 | 88.167 |
| 3806 | 88.667 |
| 3807 | 88.667 |
| 3808 | 89.333 |
| 3809 | 89.333 |
| 3810 | 90 |
| 3811 | 90 |
| 3812 | 90.333 |
| 3813 | 90.5 |
| 3814 | 91.167 |
| 3815 | 91.333 |
| 3816 | 91.5 |
| 3817 | 91.667 |
| 3818 | 92 |
| 3819 | 92 |
| 3820 | 92.167 |
| 3821 | 92.333 |
| 3822 | 92.333 |
| 3823 | 92.333 |
| 3824 | 92.333 |
| 3825 | 92.667 |
| 3826 | 92.667 |
| 3827 | 92.667 |
| 3828 | 92.667 |
| 3829 | 92.333 |
| 3830 | 92.333 |
| 3831 | 92 |
| 3832 | 92 |
| 3833 | 91.5 |
| 3834 | 91.5 |
| 3835 | 90.833 |
| 3836 | 90.833 |
| 3837 | 90.5 |
| 3838 | 90.5 |
| 3839 | 90.333 |
| 3840 | 90.333 |
| 3841 | 90 |
| 3842 | 90 |
| 3843 | 90 |
| 3844 | 90 |
| 3845 | 90.167 |
| 3846 | 90 |
| 3847 | 90.167 |
| 3848 | 90.167 |
| 3849 | 90.167 |
| 3850 | 90 |
| 3851 | 90 |
| 3852 | 90.167 |
| 3853 | 90.5 |
| 3854 | 90.5 |
| 3855 | 91.167 |
| 3856 | 91.167 |
| 3857 | 92.167 |
| 3858 | 92.333 |
| 3859 | 92.5 |
| 3860 | 92.333 |
| 3861 | 92 |
| 3862 | 92 |
| 3863 | 91.5 |
| 3864 | 91.5 |
| 3865 | 91.333 |
| 3866 | 91.333 |
| 3867 | 91.167 |
| 3868 | 91 |
| 3869 | 91.167 |
| 3870 | 91.333 |
| 3871 | 91.667 |
| 3872 | 91.833 |
| 3873 | 92.667 |
| 3874 | 92.833 |
| 3875 | 93 |
| 3876 | 93.167 |
| 3877 | 92.5 |
| 3878 | 92.5 |
| 3879 | 92.333 |
| 3880 | 92.333 |
| 3881 | 92 |
| 3882 | 92 |
| 3883 | 92 |
| 3884 | 92 |
| 3885 | 91.5 |
| 3886 | 91.5 |
| 3887 | 91 |
| 3888 | 90.833 |
| 3889 | 90.667 |
| 3890 | 90.333 |
| 3891 | 90.333 |
| 3892 | 90.167 |
| 3893 | 90.333 |
| 3894 | 90.167 |
| 3895 | 90.167 |
| 3896 | 90.5 |
| 3897 | 90.5 |
| 3898 | 90.333 |
| 3899 | 90.167 |
| 3900 | 90.333 |
| 3901 | 90.333 |
| 3902 | 90.5 |
| 3903 | 90.5 |
| 3904 | 90.333 |
| 3905 | 90.5 |
| 3906 | 90.5 |
| 3907 | 90.5 |
| 3908 | 90.667 |
| 3909 | 90.833 |
| 3910 | 90.833 |
| 3911 | 90.833 |
| 3912 | 91 |
| 3913 | 91 |
| 3914 | 91.333 |
| 3915 | 91.333 |
| 3916 | 91.333 |
| 3917 | 91.167 |
| 3918 | 91 |
| 3919 | 90.833 |
| 3920 | 91 |
| 3921 | 91.167 |
| 3922 | 91.167 |
| 3923 | 91.333 |
| 3924 | 91.333 |
| 3925 | 91.333 |
| 3926 | 91.333 |
| 3927 | 91 |
| 3928 | 91 |
| 3929 | 90.667 |
| 3930 | 90.667 |
| 3931 | 90.833 |
| 3932 | 90.833 |
| 3933 | 90.833 |
| 3934 | 90.833 |
| 3935 | 90.833 |
| 3936 | 90.833 |
| 3937 | 90.833 |
| 3938 | 90.667 |
| 3939 | 90.833 |
| 3940 | 90.833 |
| 3941 | 90.833 |
| 3942 | 90.833 |
| 3943 | 90.833 |
| 3944 | 91 |
| 3945 | 91.167 |
| 3946 | 91.167 |
| 3947 | 91.167 |
| 3948 | 91.167 |
| 3949 | 91.333 |
| 3950 | 90.333 |
| 3951 | 90.333 |
| 3952 | 90 |
| 3953 | 89.833 |
| 3954 | 89.833 |
| 3955 | 90.167 |
| 3956 | 90.333 |
| 3957 | 90.5 |
| 3958 | 90.5 |
| 3959 | 89.833 |
| 3960 | 89.833 |
| 3961 | 89.333 |
| 3962 | 89.333 |
| 3963 | 89.5 |
| 3964 | 89.5 |
| 3965 | 89.5 |
| 3966 | 89.5 |
| 3967 | 90.333 |
| 3968 | 90.167 |
| 3969 | 91 |
| 3970 | 91 |
| 3971 | 91.5 |
| 3972 | 91.5 |
| 3973 | 91.667 |
| 3974 | 91.667 |
| 3975 | 91.667 |
| 3976 | 91.667 |
| 3977 | 91.667 |
| 3978 | 91.5 |
| 3979 | 91.333 |
| 3980 | 91.5 |
| 3981 | 91.5 |
| 3982 | 91.5 |
| 3983 | 92 |
| 3984 | 91.833 |
| 3985 | 92 |
| 3986 | 92 |
| 3987 | 92.5 |
| 3988 | 92.5 |
| 3989 | 92.667 |
| 3990 | 92.5 |
| 3991 | 92.5 |
| 3992 | 92.5 |
| 3993 | 92.667 |
| 3994 | 92.667 |
| 3995 | 92.667 |
| 3996 | 92.667 |
| 3997 | 92.5 |
| 3998 | 92.5 |
| 3999 | 92.833 |
| 4000 | 92.833 |
| 4001 | 93.5 |
| 4002 | 93.333 |
| 4003 | 93.5 |
| 4004 | 93.5 |
| 4005 | 93.333 |
| 4006 | 93.5 |
| 4007 | 93.5 |
| 4008 | 93.667 |
| 4009 | 93.5 |
| 4010 | 93.5 |
| 4011 | 93.667 |
| 4012 | 93.667 |
| 4013 | 93.833 |
| 4014 | 93.833 |
| 4015 | 93.667 |
| 4016 | 93.667 |
| 4017 | 93.833 |
| 4018 | 93.833 |
| 4019 | 94.333 |
| 4020 | 94.333 |
| 4021 | 94.833 |
| 4022 | 94.833 |
| 4023 | 94.5 |
| 4024 | 94.5 |
| 4025 | 94.167 |
| 4026 | 94 |
| 4027 | 94 |
| 4028 | 94 |
| 4029 | 93.667 |
| 4030 | 93.5 |
| 4031 | 92.833 |
| 4032 | 93 |
| 4033 | 92.667 |
| 4034 | 92.667 |
| 4035 | 91.833 |
| 4036 | 91.833 |
| 4037 | 91.667 |
| 4038 | 91.667 |
| 4039 | 92.333 |
| 4040 | 92.333 |
| 4041 | 92.5 |
| 4042 | 92.5 |
| 4043 | 92.333 |
| 4044 | 92.5 |
| 4045 | 92.333 |
| 4046 | 92.333 |
| 4047 | 92.5 |
| 4048 | 92.5 |
| 4049 | 92.333 |
| 4050 | 92.167 |
| 4051 | 91.333 |
| 4052 | 91.333 |
| 4053 | 90.833 |
| 4054 | 90.833 |
| 4055 | 90 |
| 4056 | 90 |
| 4057 | 89.833 |
| 4058 | 89.833 |
| 4059 | 90 |
| 4060 | 89.833 |
| 4061 | 89.667 |
| 4062 | 89.5 |
| 4063 | 89.167 |
| 4064 | 89.167 |
| 4065 | 89.667 |
| 4066 | 89.667 |
| 4067 | 90.167 |
| 4068 | 90.167 |
| 4069 | 91 |
| 4070 | 91 |
| 4071 | 91.833 |
| 4072 | 92 |
| 4073 | 92.5 |
| 4074 | 92.667 |
| 4075 | 92.667 |
| 4076 | 92.667 |
| 4077 | 92.333 |
| 4078 | 92.333 |
| 4079 | 92.167 |
| 4080 | 92.333 |
| 4081 | 92.333 |
| 4082 | 92.167 |
| 4083 | 91.333 |
| 4084 | 91.333 |
| 4085 | 91.333 |
| 4086 | 91.167 |
| 4087 | 91 |
| 4088 | 91 |
| 4089 | 90.833 |
| 4090 | 90.833 |
| 4091 | 90.833 |
| 4092 | 90.833 |
| 4093 | 90.667 |
| 4094 | 90.833 |
| 4095 | 91 |
| 4096 | 91 |
| 4097 | 91.333 |
| 4098 | 91.333 |
| 4099 | 91.667 |
| 4100 | 91.833 |
| 4101 | 92.167 |
| 4102 | 92.167 |
| 4103 | 92.5 |
| 4104 | 92.5 |
| 4105 | 92.667 |
| 4106 | 92.667 |
| 4107 | 92.5 |
| 4108 | 92.5 |
| 4109 | 92.333 |
| 4110 | 92.333 |
| 4111 | 92.333 |
| 4112 | 92.333 |
| 4113 | 91.833 |
| 4114 | 91.833 |
| 4115 | 92 |
| 4116 | 92.167 |
| 4117 | 91.833 |
| 4118 | 91.833 |
| 4119 | 90.833 |
| 4120 | 90.667 |
| 4121 | 90 |
| 4122 | 89.667 |
| 4123 | 89.5 |
| 4124 | 89 |
| 4125 | 88.667 |
| 4126 | 88.5 |
| 4127 | 88.5 |
| 4128 | 88.667 |
| 4129 | 88.833 |
| 4130 | 89.167 |
| 4131 | 89.167 |
| 4132 | 89.167 |
| 4133 | 89.167 |
| 4134 | 89.167 |
| 4135 | 89.333 |
| 4136 | 89.333 |
| 4137 | 89.167 |
| 4138 | 89.167 |
| 4139 | 89 |
| 4140 | 89.167 |
| 4141 | 89.167 |
| 4142 | 89.667 |
| 4143 | 89.667 |
| 4144 | 90.167 |
| 4145 | 90.333 |
| 4146 | 91 |
| 4147 | 91 |
| 4148 | 91.833 |
| 4149 | 91.833 |
| 4150 | 92.167 |
| 4151 | 92 |
| 4152 | 92.167 |
| 4153 | 92 |
| 4154 | 92.333 |
| 4155 | 92.333 |
| 4156 | 92 |
| 4157 | 91.833 |
| 4158 | 91.333 |
| 4159 | 91.333 |
| 4160 | 90.833 |
| 4161 | 90.833 |
| 4162 | 90.833 |
| 4163 | 90.833 |
| 4164 | 91 |
| 4165 | 91 |
| 4166 | 90.833 |
| 4167 | 90.833 |
| 4168 | 90.667 |
| 4169 | 90.667 |
| 4170 | 90.5 |
| 4171 | 90.333 |
| 4172 | 90.167 |
| 4173 | 90 |
| 4174 | 90 |
| 4175 | 90 |
| 4176 | 90 |
| 4177 | 90 |
| 4178 | 90.333 |
| 4179 | 90.333 |
| 4180 | 90.333 |
| 4181 | 90.333 |
| 4182 | 90.333 |
| 4183 | 90.333 |
| 4184 | 90.333 |
| 4185 | 90.333 |
| 4186 | 89.833 |
| 4187 | 89.833 |
| 4188 | 89.833 |
| 4189 | 89.833 |
| 4190 | 89.833 |
| 4191 | 89.833 |
| 4192 | 89.667 |
| 4193 | 89.667 |
| 4194 | 90.167 |
| 4195 | 90.333 |
| 4196 | 90.667 |
| 4197 | 90.833 |
| 4198 | 91.667 |
| 4199 | 91.667 |
| 4200 | 92.5 |
| 4201 | 92.5 |
| 4202 | 93.167 |
| 4203 | 93.167 |
| 4204 | 94 |
| 4205 | 94 |
| 4206 | 93.833 |
| 4207 | 93.833 |
| 4208 | 93.833 |
| 4209 | 93.667 |
| 4210 | 93 |
| 4211 | 92.833 |
| 4212 | 92.167 |
| 4213 | 92 |
| 4214 | 92 |
| 4215 | 91.667 |
| 4216 | 91.667 |
| 4217 | 91 |
| 4218 | 90.833 |
| 4219 | 90.167 |
| 4220 | 90.167 |
| 4221 | 89.167 |
| 4222 | 89 |
| 4223 | 88.5 |
| 4224 | 88.5 |
| 4225 | 88 |
| 4226 | 88 |
| 4227 | 87.667 |
| 4228 | 88.333 |
| 4229 | 88.333 |
| 4230 | 88.667 |
| 4231 | 88.667 |
| 4232 | 88.833 |
| 4233 | 88.833 |
| 4234 | 89.167 |
| 4235 | 89.167 |
| 4236 | 89.667 |
| 4237 | 89.667 |
| 4238 | 89.833 |
| 4239 | 89.833 |
| 4240 | 89.833 |
| 4241 | 89.833 |
| 4242 | 90.333 |
| 4243 | 90.833 |
| 4244 | 91 |
| 4245 | 91.833 |
| 4246 | 92 |
| 4247 | 92.333 |
| 4248 | 92.5 |
| 4249 | 92.667 |
| 4250 | 92.833 |
| 4251 | 93 |
| 4252 | 93.167 |
| 4253 | 93.333 |
| 4254 | 93.5 |
| 4255 | 93.833 |
| 4256 | 93.833 |
| 4257 | 94.333 |
| 4258 | 94.333 |
| 4259 | 94.333 |
| 4260 | 94 |
| 4261 | 94 |
| 4262 | 93.5 |
| 4263 | 93.333 |
| 4264 | 93.167 |
| 4265 | 93.167 |
| 4266 | 93 |
| 4267 | 93 |
| 4268 | 92.167 |
| 4269 | 92.333 |
| 4270 | 91.5 |
| 4271 | 91.5 |
| 4272 | 90.833 |
| 4273 | 90.833 |
| 4274 | 91 |
| 4275 | 91 |
| 4276 | 90.833 |
| 4277 | 90.833 |
| 4278 | 90.667 |
| 4279 | 90.667 |
| 4280 | 90.167 |
| 4281 | 90.167 |
| 4282 | 90.333 |
| 4283 | 90.333 |
| 4284 | 90.333 |
| 4285 | 90.5 |
| 4286 | 90.667 |
| 4287 | 90.667 |
| 4288 | 90.833 |
| 4289 | 91 |
| 4290 | 90.833 |
| 4291 | 90.833 |
| 4292 | 91 |
| 4293 | 91.167 |
| 4294 | 91.167 |
| 4295 | 90.833 |
| 4296 | 90.833 |
| 4297 | 91.167 |
| 4298 | 91.167 |
| 4299 | 92 |
| 4300 | 92.167 |
| 4301 | 92.167 |
| 4302 | 92.167 |
| 4303 | 92.5 |
| 4304 | 92.5 |
| 4305 | 92.833 |
| 4306 | 93 |
| 4307 | 92.833 |
| 4308 | 93 |
| 4309 | 92.833 |
| 4310 | 92.833 |
| 4311 | 92.833 |
| 4312 | 93 |
| 4313 | 93 |
| 4314 | 93 |
| 4315 | 93 |
| 4316 | 92.833 |
| 4317 | 92.833 |
| 4318 | 93 |
| 4319 | 93.167 |
| 4320 | 93.167 |
| 4321 | 93 |
| 4322 | 93 |
| 4323 | 93 |
| 4324 | 93.167 |
| 4325 | 93.667 |
| 4326 | 93.5 |
| 4327 | 93.5 |
| 4328 | 93.333 |
| 4329 | 93.333 |
| 4330 | 93.333 |
| 4331 | 93.333 |
| 4332 | 93.5 |
| 4333 | 93.667 |
| 4334 | 93.167 |
| 4335 | 93.167 |
| 4336 | 92.833 |
| 4337 | 92.833 |
| 4338 | 92.833 |
| 4339 | 92.833 |
| 4340 | 93 |
| 4341 | 93.167 |
| 4342 | 92.833 |
| 4343 | 92.667 |
| 4344 | 92 |
| 4345 | 91.833 |
| 4346 | 91.667 |
| 4347 | 91.667 |
| 4348 | 91.5 |
| 4349 | 91.333 |
| 4350 | 90.667 |
| 4351 | 90.5 |
| 4352 | 90.167 |
| 4353 | 90 |
| 4354 | 89.833 |
| 4355 | 89.833 |
| 4356 | 89.667 |
| 4357 | 89.5 |
| 4358 | 89.5 |
| 4359 | 89.5 |
| 4360 | 89.833 |
| 4361 | 91 |
| 4362 | 91 |
| 4363 | 91.667 |
| 4364 | 91.667 |
| 4365 | 91.833 |
| 4366 | 91.833 |
| 4367 | 91.833 |
| 4368 | 91.833 |
| 4369 | 91.833 |
| 4370 | 91.833 |
| 4371 | 91.667 |
| 4372 | 91.5 |
| 4373 | 91.5 |
| 4374 | 91.333 |
| 4375 | 91.5 |
| 4376 | 91.5 |
| 4377 | 91.667 |
| 4378 | 91.667 |
| 4379 | 91.5 |
| 4380 | 91.5 |
| 4381 | 91.5 |
| 4382 | 91.5 |
| 4383 | 91.333 |
| 4384 | 91.333 |
| 4385 | 91 |
| 4386 | 91 |
| 4387 | 90.667 |
| 4388 | 90.667 |
| 4389 | 90.333 |
| 4390 | 90.167 |
| 4391 | 90 |
| 4392 | 90 |
| 4393 | 90.333 |
| 4394 | 90.333 |
| 4395 | 90.5 |
| 4396 | 90.5 |
| 4397 | 90.167 |
| 4398 | 90.167 |
| 4399 | 89.667 |
| 4400 | 89.667 |
| 4401 | 89.167 |
| 4402 | 89 |
| 4403 | 88.833 |
| 4404 | 88.667 |
| 4405 | 88.667 |
| 4406 | 88.667 |
| 4407 | 88.667 |
| 4408 | 88.667 |
| 4409 | 88.667 |
| 4410 | 88.5 |
| 4411 | 88.5 |
| 4412 | 88.667 |
| 4413 | 88.667 |
| 4414 | 89 |
| 4415 | 89 |
| 4416 | 88.833 |
| 4417 | 88.833 |
| 4418 | 88.833 |
| 4419 | 88.833 |
| 4420 | 89 |
| 4421 | 88.833 |
| 4422 | 89 |
| 4423 | 89 |
| 4424 | 89.333 |
| 4425 | 89.5 |
| 4426 | 89.833 |
| 4427 | 89.833 |
| 4428 | 89.833 |
| 4429 | 90 |
| 4430 | 90 |
| 4431 | 90 |
| 4432 | 90.5 |
| 4433 | 90.5 |
| 4434 | 91.167 |
| 4435 | 91.333 |
| 4436 | 91.833 |
| 4437 | 92 |
| 4438 | 92.333 |
| 4439 | 92.333 |
| 4440 | 92.333 |
| 4441 | 92.333 |
| 4442 | 92.333 |
| 4443 | 92.333 |
| 4444 | 92.333 |
| 4445 | 92.333 |
| 4446 | 92.333 |
| 4447 | 92.333 |
| 4448 | 92.333 |
| 4449 | 92.333 |
| 4450 | 92.333 |
| 4451 | 92.667 |
| 4452 | 92.5 |
| 4453 | 92.5 |
| 4454 | 92.5 |
| 4455 | 92 |
| 4456 | 92 |
| 4457 | 91.667 |
| 4458 | 91.667 |
| 4459 | 91.5 |
| 4460 | 91.5 |
| 4461 | 91.5 |
| 4462 | 91.5 |
| 4463 | 91.833 |
| 4464 | 91.833 |
| 4465 | 92.333 |
| 4466 | 92.333 |
| 4467 | 92.667 |
| 4468 | 92.667 |
| 4469 | 92.333 |
| 4470 | 92.333 |
| 4471 | 91.667 |
| 4472 | 91.5 |
| 4473 | 90.667 |
| 4474 | 90.667 |
| 4475 | 90.167 |
| 4476 | 90 |
| 4477 | 89.667 |
| 4478 | 89.667 |
| 4479 | 89.5 |
| 4480 | 89.667 |
| 4481 | 89.833 |
| 4482 | 89.833 |
| 4483 | 90 |
| 4484 | 90 |
| 4485 | 90.5 |
| 4486 | 90.667 |
| 4487 | 91 |
| 4488 | 91 |
| 4489 | 91 |
| 4490 | 91.167 |
| 4491 | 91.167 |
| 4492 | 91.167 |
| 4493 | 91 |
| 4494 | 91 |
| 4495 | 91.167 |
| 4496 | 91.167 |
| 4497 | 91.167 |
| 4498 | 91.167 |
| 4499 | 91.5 |
| 4500 | 91.667 |
| 4501 | 91.667 |
| 4502 | 91.667 |
| 4503 | 91.667 |
| 4504 | 91.667 |
| 4505 | 91.5 |
| 4506 | 91.5 |
| 4507 | 91.5 |
| 4508 | 91.333 |
| 4509 | 90.833 |
| 4510 | 90.833 |
| 4511 | 91 |
| 4512 | 91 |
| 4513 | 90.833 |
| 4514 | 90.667 |
| 4515 | 89.833 |
| 4516 | 89.833 |
| 4517 | 89.5 |
| 4518 | 89.5 |
| 4519 | 89.667 |
| 4520 | 89.667 |
| 4521 | 90.333 |
| 4522 | 90.333 |
| 4523 | 91 |
| 4524 | 91.167 |
| 4525 | 91.667 |
| 4526 | 91.833 |
| 4527 | 92.5 |
| 4528 | 92.667 |
| 4529 | 93.167 |
| 4530 | 93.167 |
| 4531 | 93.333 |
| 4532 | 93.5 |
| 4533 | 93.5 |
| 4534 | 93.667 |
| 4535 | 93.667 |
| 4536 | 93.333 |
| 4537 | 93.167 |
| 4538 | 93 |
| 4539 | 92.833 |
| 4540 | 92.833 |
| 4541 | 93 |
| 4542 | 93 |
| 4543 | 93.167 |
| 4544 | 93.833 |
| 4545 | 94 |
| 4546 | 93.833 |
| 4547 | 93.833 |
| 4548 | 94.167 |
| 4549 | 94.333 |
| 4550 | 94.833 |
| 4551 | 95 |
| 4552 | 95.833 |
| 4553 | 95.833 |
| 4554 | 96.167 |
| 4555 | 96.667 |
| 4556 | 96.667 |
| 4557 | 96.667 |
| 4558 | 96.667 |
| 4559 | 96.167 |
| 4560 | 96.167 |
| 4561 | 95.167 |
| 4562 | 95.167 |
| 4563 | 94.833 |
| 4564 | 94.833 |
| 4565 | 94.333 |
| 4566 | 94.333 |
| 4567 | 93.667 |
| 4568 | 93.5 |
| 4569 | 93.5 |
| 4570 | 93.5 |
| 4571 | 93.167 |
| 4572 | 93 |
| 4573 | 92.167 |
| 4574 | 91.333 |
| 4575 | 91.167 |
| 4576 | 90.333 |
| 4577 | 90.333 |
| 4578 | 90 |
| 4579 | 90 |
| 4580 | 90.333 |
| 4581 | 90.333 |
| 4582 | 90.5 |
| 4583 | 90.667 |
| 4584 | 91.333 |
| 4585 | 91.5 |
| 4586 | 91.833 |
| 4587 | 91.833 |
| 4588 | 91.833 |
| 4589 | 91.833 |
| 4590 | 91.667 |
| 4591 | 91.667 |
| 4592 | 91.667 |
| 4593 | 92.333 |
| 4594 | 92.333 |
| 4595 | 93.5 |
| 4596 | 93.5 |
| 4597 | 95.333 |
| 4598 | 95.333 |
| 4599 | 96.5 |
| 4600 | 96.667 |
| 4601 | 97.833 |
| 4602 | 97.833 |
| 4603 | 99 |
| 4604 | 99 |
| 4605 | 99.5 |
| 4606 | 99.5 |
| 4607 | 99.667 |
| 4608 | 99.667 |
| 4609 | 100.167 |
| 4610 | 100.167 |
| 4611 | 100.167 |
| 4612 | 100.333 |
| 4613 | 100.5 |
| 4614 | 100.5 |
| 4615 | 100.333 |
| 4616 | 100.167 |
| 4617 | 99.833 |
| 4618 | 99.833 |
| 4619 | 99.667 |
| 4620 | 99.667 |
| 4621 | 99.667 |
| 4622 | 99.667 |
| 4623 | 99.667 |
| 4624 | 99.667 |
| 4625 | 99.5 |
| 4626 | 99.5 |
| 4627 | 99.667 |
| 4628 | 99.667 |
| 4629 | 99.833 |
| 4630 | 99.833 |
| 4631 | 100.5 |
| 4632 | 100.5 |
| 4633 | 100.667 |
| 4634 | 100.667 |
| 4635 | 100.667 |
| 4636 | 100.5 |
| 4637 | 100.167 |
| 4638 | 100.167 |
| 4639 | 100.5 |
| 4640 | 100.5 |
| 4641 | 101 |
| 4642 | 101 |
| 4643 | 101 |
| 4644 | 101 |
| 4645 | 100.833 |
| 4646 | 100.833 |
| 4647 | 100.5 |
| 4648 | 100.5 |
| 4649 | 100.333 |
| 4650 | 100.167 |
| 4651 | 100 |
| 4652 | 100 |
| 4653 | 99.833 |
| 4654 | 99.833 |
| 4655 | 100 |
| 4656 | 100 |
| 4657 | 99.833 |
| 4658 | 99.833 |
| 4659 | 99.833 |
| 4660 | 99.833 |
| 4661 | 99.667 |
| 4662 | 99.667 |
| 4663 | 99.5 |
| 4664 | 99.167 |
| 4665 | 99.167 |
| 4666 | 99 |
| 4667 | 99 |
| 4668 | 99 |
| 4669 | 99.167 |
| 4670 | 99.167 |
| 4671 | 98.667 |
| 4672 | 98.5 |
| 4673 | 98.333 |
| 4674 | 98.5 |
| 4675 | 98 |
| 4676 | 98 |
| 4677 | 97.833 |
| 4678 | 97.833 |
| 4679 | 97.833 |
| 4680 | 98 |
| 4681 | 97.833 |
| 4682 | 98.167 |
| 4683 | 98.167 |
| 4684 | 98.5 |
| 4685 | 98.333 |
| 4686 | 98.333 |
| 4687 | 98.5 |
| 4688 | 98.333 |
| 4689 | 98.333 |
| 4690 | 98.667 |
| 4691 | 98.833 |
| 4692 | 99.167 |
| 4693 | 99.333 |
| 4694 | 99.833 |
| 4695 | 100 |
| 4696 | 100.667 |
| 4697 | 100.833 |
| 4698 | 101.333 |
| 4699 | 101.5 |
| 4700 | 101.5 |
| 4701 | 101.833 |
| 4702 | 101.833 |
| 4703 | 101.833 |
| 4704 | 101.833 |
| 4705 | 101.833 |
| 4706 | 102.167 |
| 4707 | 102.167 |
| 4708 | 102 |
| 4709 | 101.5 |
| 4710 | 101.333 |
| 4711 | 101.333 |
| 4712 | 101.167 |
| 4713 | 101.167 |
| 4714 | 101.167 |
| 4715 | 101.167 |
| 4716 | 101.167 |
| 4717 | 101.333 |
| 4718 | 101.5 |
| 4719 | 101.667 |
| 4720 | 102 |
| 4721 | 102 |
| 4722 | 102.167 |
| 4723 | 102.167 |
| 4724 | 102.167 |
| 4725 | 102.167 |
| 4726 | 102 |
| 4727 | 102.167 |
| 4728 | 102.167 |
| 4729 | 102.167 |
| 4730 | 102.5 |
| 4731 | 102.5 |
| 4732 | 102.667 |
| 4733 | 102.667 |
| 4734 | 102.833 |
| 4735 | 102.833 |
| 4736 | 102.667 |
| 4737 | 102.5 |
| 4738 | 102.167 |
| 4739 | 102.167 |
| 4740 | 101.833 |
| 4741 | 101.833 |
| 4742 | 101.333 |
| 4743 | 101.167 |
| 4744 | 100.833 |
| 4745 | 100.667 |
| 4746 | 100.5 |
| 4747 | 100.333 |
| 4748 | 100.333 |
| 4749 | 100.333 |
| 4750 | 100.5 |
| 4751 | 100.333 |
| 4752 | 100.333 |
| 4753 | 100.333 |
| 4754 | 100.333 |
| 4755 | 100.333 |
| 4756 | 100.333 |
| 4757 | 100.333 |
| 4758 | 100.667 |
| 4759 | 100.667 |
| 4760 | 100.833 |
| 4761 | 100.833 |
| 4762 | 100.833 |
| 4763 | 100.833 |
| 4764 | 100.667 |
| 4765 | 100.5 |
| 4766 | 100 |
| 4767 | 100 |
| 4768 | 100 |
| 4769 | 99.833 |
| 4770 | 99.333 |
| 4771 | 99.333 |
| 4772 | 99 |
| 4773 | 99 |
| 4774 | 98.833 |
| 4775 | 98.667 |
| 4776 | 98.5 |
| 4777 | 98.5 |
| 4778 | 98 |
| 4779 | 98 |
| 4780 | 97.333 |
| 4781 | 97.333 |
| 4782 | 97.333 |
| 4783 | 97.333 |
| 4784 | 96.833 |
| 4785 | 96.833 |
| 4786 | 96.833 |
| 4787 | 96.667 |
| 4788 | 96.667 |
| 4789 | 96.833 |
| 4790 | 96.833 |
| 4791 | 97.333 |
| 4792 | 97.167 |
| 4793 | 98 |
| 4794 | 98.167 |
| 4795 | 99 |
| 4796 | 99 |
| 4797 | 99.667 |
| 4798 | 99.667 |
| 4799 | 100.167 |
| 4800 | 100.167 |
| 4801 | 100.5 |
| 4802 | 100.5 |
| 4803 | 100.667 |
| 4804 | 100.667 |
| 4805 | 100.833 |
| 4806 | 100.833 |
| 4807 | 100.667 |
| 4808 | 100.667 |
| 4809 | 100.5 |
| 4810 | 100.5 |
| 4811 | 100.5 |
| 4812 | 100.5 |
| 4813 | 100.333 |
| 4814 | 100.333 |
| 4815 | 100.167 |
| 4816 | 100.333 |
| 4817 | 100.333 |
| 4818 | 100.333 |
| 4819 | 100.667 |
| 4820 | 100.667 |
| 4821 | 100.667 |
| 4822 | 100.667 |
| 4823 | 100.333 |
| 4824 | 100.5 |
| 4825 | 100.5 |
| 4826 | 100.5 |
| 4827 | 100 |
| 4828 | 100 |
| 4829 | 100 |
| 4830 | 100 |
| 4831 | 99.667 |
| 4832 | 99.667 |
| 4833 | 99.5 |
| 4834 | 99.5 |
| 4835 | 99.5 |
| 4836 | 99.667 |
| 4837 | 99.5 |
| 4838 | 99.667 |
| 4839 | 100 |
| 4840 | 100 |
| 4841 | 100.167 |
| 4842 | 100.333 |
| 4843 | 100.667 |
| 4844 | 100.667 |
| 4845 | 100.833 |
| 4846 | 100.833 |
| 4847 | 101.5 |
| 4848 | 101.5 |
| 4849 | 101.833 |
| 4850 | 102 |
| 4851 | 101.833 |
| 4852 | 101.667 |
| 4853 | 101.333 |
| 4854 | 101.167 |
| 4855 | 101.167 |
| 4856 | 101.333 |
| 4857 | 101.333 |
| 4858 | 101.167 |
| 4859 | 101.167 |
| 4860 | 101.167 |
| 4861 | 101.167 |
| 4862 | 101.167 |
| 4863 | 100.833 |
| 4864 | 100.667 |
| 4865 | 100 |
| 4866 | 100 |
| 4867 | 99.5 |
| 4868 | 99.5 |
| 4869 | 99 |
| 4870 | 99 |
| 4871 | 98.333 |
| 4872 | 98.333 |
| 4873 | 97.833 |
| 4874 | 97.833 |
| 4875 | 98.167 |
| 4876 | 98.167 |
| 4877 | 98.5 |
| 4878 | 98.5 |
| 4879 | 98.667 |
| 4880 | 98.833 |
| 4881 | 99.167 |
| 4882 | 99.167 |
| 4883 | 99.667 |
| 4884 | 99.667 |
| 4885 | 100 |
| 4886 | 100 |
| 4887 | 100.5 |
| 4888 | 100.5 |
| 4889 | 100.667 |
| 4890 | 100.5 |
| 4891 | 100.333 |
| 4892 | 100.333 |
| 4893 | 100.167 |
| 4894 | 100.167 |
| 4895 | 99.833 |
| 4896 | 99.333 |
| 4897 | 99.167 |
| 4898 | 98.5 |
| 4899 | 98.5 |
| 4900 | 98.333 |
| 4901 | 98.333 |
| 4902 | 98.167 |
| 4903 | 98.167 |
| 4904 | 98 |
| 4905 | 98 |
| 4906 | 97.667 |
| 4907 | 97.667 |
| 4908 | 97 |
| 4909 | 97 |
| 4910 | 96.667 |
| 4911 | 96.833 |
| 4912 | 96.667 |
| 4913 | 96.667 |
| 4914 | 97.167 |
| 4915 | 97.167 |
| 4916 | 97.833 |
| 4917 | 97.833 |
| 4918 | 98.333 |
| 4919 | 98.333 |
| 4920 | 99.167 |
| 4921 | 99.167 |
| 4922 | 100.167 |
| 4923 | 100.5 |
| 4924 | 101.5 |
| 4925 | 101.667 |
| 4926 | 101.833 |
| 4927 | 101.833 |
| 4928 | 101.5 |
| 4929 | 100.833 |
| 4930 | 100.667 |
| 4931 | 100 |
| 4932 | 99.833 |
| 4933 | 99.5 |
| 4934 | 99.333 |
| 4935 | 99.167 |
| 4936 | 99.167 |
| 4937 | 98.833 |
| 4938 | 98.667 |
| 4939 | 98.167 |
| 4940 | 98 |
| 4941 | 98.333 |
| 4942 | 98.167 |
| 4943 | 98.333 |
| 4944 | 98.333 |
| 4945 | 98.667 |
| 4946 | 98.667 |
| 4947 | 99.167 |
| 4948 | 99.167 |
| 4949 | 99.333 |
| 4950 | 99.5 |
| 4951 | 99.5 |
| 4952 | 99.5 |
| 4953 | 100 |
| 4954 | 100 |
| 4955 | 100.833 |
| 4956 | 100.833 |
| 4957 | 101 |
| 4958 | 101 |
| 4959 | 101 |
| 4960 | 100.833 |
| 4961 | 101.333 |
| 4962 | 101.333 |
| 4963 | 101.333 |
| 4964 | 101.333 |
| 4965 | 101.833 |
| 4966 | 102 |
| 4967 | 102.167 |
| 4968 | 102.5 |
| 4969 | 102.5 |
| 4970 | 102.667 |
| 4971 | 102.667 |
| 4972 | 102.833 |
| 4973 | 102.667 |
| 4974 | 102.333 |
| 4975 | 102.333 |
| 4976 | 102 |
| 4977 | 102 |
| 4978 | 101.833 |
| 4979 | 101.667 |
| 4980 | 101.5 |
| 4981 | 101.5 |
| 4982 | 101.5 |
| 4983 | 101.5 |
| 4984 | 101.5 |
| 4985 | 101.5 |
| 4986 | 101.333 |
| 4987 | 101.333 |
| 4988 | 101.167 |
| 4989 | 101.167 |
| 4990 | 101 |
| 4991 | 100.833 |
| 4992 | 100.667 |
| 4993 | 100.5 |
| 4994 | 99.833 |
| 4995 | 99.833 |
| 4996 | 99.833 |
| 4997 | 99.667 |
| 4998 | 99.667 |
| 4999 | 99.833 |
| 5000 | 99.833 |
| 5001 | 99.667 |
| 5002 | 99.667 |
| 5003 | 99.833 |
| 5004 | 99.833 |
| 5005 | 100 |
| 5006 | 99.833 |
| 5007 | 100 |
| 5008 | 100 |
| 5009 | 100.167 |
| 5010 | 100.167 |
| 5011 | 100.167 |
| 5012 | 100.333 |
| 5013 | 100.167 |
| 5014 | 100 |
| 5015 | 99.833 |
| 5016 | 99.833 |
| 5017 | 99.167 |
| 5018 | 99.167 |
| 5019 | 98.833 |
| 5020 | 98.833 |
| 5021 | 98.833 |
| 5022 | 98.667 |
| 5023 | 98.167 |
| 5024 | 98.167 |
| 5025 | 98.667 |
| 5026 | 98.833 |
| 5027 | 99.333 |
| 5028 | 99.5 |
| 5029 | 100.333 |
| 5030 | 100.333 |
| 5031 | 100.667 |
| 5032 | 100.833 |
| 5033 | 101.667 |
| 5034 | 101.833 |
| 5035 | 102.833 |
| 5036 | 102.667 |
| 5037 | 103 |
| 5038 | 103 |
| 5039 | 103.167 |
| 5040 | 103.167 |
| 5041 | 103.333 |
| 5042 | 103.167 |
| 5043 | 103 |
| 5044 | 103 |
| 5045 | 103.167 |
| 5046 | 103.167 |
| 5047 | 103.167 |
| 5048 | 103.167 |
| 5049 | 103.167 |
| 5050 | 103 |
| 5051 | 103 |
| 5052 | 103 |
| 5053 | 102.833 |
| 5054 | 102.833 |
| 5055 | 102.5 |
| 5056 | 102.333 |
| 5057 | 102 |
| 5058 | 102 |
| 5059 | 101.333 |
| 5060 | 101 |
| 5061 | 100.333 |
| 5062 | 100.333 |
| 5063 | 100.167 |
| 5064 | 100.167 |
| 5065 | 100.167 |
| 5066 | 100.167 |
| 5067 | 100.167 |
| 5068 | 100.167 |
| 5069 | 100.167 |
| 5070 | 100.333 |
| 5071 | 100.5 |
| 5072 | 100.5 |
| 5073 | 101.167 |
| 5074 | 101.167 |
| 5075 | 101.5 |
| 5076 | 101.5 |
| 5077 | 101.5 |
| 5078 | 101.5 |
| 5079 | 100.667 |
| 5080 | 100.667 |
| 5081 | 100 |
| 5082 | 99.833 |
| 5083 | 99 |
| 5084 | 99 |
| 5085 | 99 |
| 5086 | 99 |
| 5087 | 99.167 |
| 5088 | 99.333 |
| 5089 | 99.667 |
| 5090 | 100 |
| 5091 | 100.167 |
| 5092 | 100.167 |
| 5093 | 100.333 |
| 5094 | 100.333 |
| 5095 | 100.333 |
| 5096 | 100.333 |
| 5097 | 100.333 |
| 5098 | 100.167 |
| 5099 | 100.167 |
| 5100 | 100.167 |
| 5101 | 100.167 |
| 5102 | 100 |
| 5103 | 100 |
| 5104 | 99.667 |
| 5105 | 99.667 |
| 5106 | 99.5 |
| 5107 | 99.333 |
| 5108 | 99.5 |
| 5109 | 99 |
| 5110 | 98.5 |
| 5111 | 98.333 |
| 5112 | 97.833 |
| 5113 | 97.833 |
| 5114 | 97.833 |
| 5115 | 97.833 |
| 5116 | 97.5 |
| 5117 | 97.5 |
| 5118 | 97.5 |
| 5119 | 97.5 |
| 5120 | 98 |
| 5121 | 98 |
| 5122 | 97.833 |
| 5123 | 97.833 |
| 5124 | 98 |
| 5125 | 98 |
| 5126 | 98 |
| 5127 | 98.167 |
| 5128 | 98.333 |
| 5129 | 98.333 |
| 5130 | 98.5 |
| 5131 | 98.5 |
| 5132 | 98.5 |
| 5133 | 98.5 |
| 5134 | 98.667 |
| 5135 | 98.667 |
| 5136 | 99 |
| 5137 | 98.833 |
| 5138 | 98.667 |
| 5139 | 98.667 |
| 5140 | 98 |
| 5141 | 98 |
| 5142 | 97.833 |
| 5143 | 97.833 |
| 5144 | 97.5 |
| 5145 | 97.5 |
| 5146 | 97.333 |
| 5147 | 97.333 |
| 5148 | 97.833 |
| 5149 | 98 |
| 5150 | 98.667 |
| 5151 | 98.667 |
| 5152 | 99.333 |
| 5153 | 99.333 |
| 5154 | 100.167 |
| 5155 | 100.167 |
| 5156 | 100.833 |
| 5157 | 100.833 |
| 5158 | 101 |
| 5159 | 100.833 |
| 5160 | 101 |
| 5161 | 101 |
| 5162 | 100.833 |
| 5163 | 100.833 |
| 5164 | 100.667 |
| 5165 | 100.833 |
| 5166 | 101 |
| 5167 | 100.833 |
| 5168 | 100.667 |
| 5169 | 100.5 |
| 5170 | 100.333 |
| 5171 | 100.5 |
| 5172 | 100.333 |
| 5173 | 100.333 |
| 5174 | 100.167 |
| 5175 | 100.167 |
| 5176 | 100 |
| 5177 | 100 |
| 5178 | 100 |
| 5179 | 99.833 |
| 5180 | 99.833 |
| 5181 | 99.667 |
| 5182 | 99.667 |
| 5183 | 99.667 |
| 5184 | 99.5 |
| 5185 | 99.667 |
| 5186 | 99.5 |
| 5187 | 99.5 |
| 5188 | 99.333 |
| 5189 | 99.167 |
| 5190 | 99.167 |
| 5191 | 99.333 |
| 5192 | 99.167 |
| 5193 | 99.167 |
| 5194 | 99.167 |
| 5195 | 99.667 |
| 5196 | 99.5 |
| 5197 | 99.833 |
| 5198 | 99.833 |
| 5199 | 99.833 |
| 5200 | 99.833 |
| 5201 | 100 |
| 5202 | 100 |
| 5203 | 100.167 |
| 5204 | 100.167 |
| 5205 | 100.333 |
| 5206 | 100.167 |
| 5207 | 100.333 |
| 5208 | 99.833 |
| 5209 | 99.667 |
| 5210 | 99.333 |
| 5211 | 99.333 |
| 5212 | 99 |
| 5213 | 98.833 |
| 5214 | 98.333 |
| 5215 | 98 |
| 5216 | 98 |
| 5217 | 98.167 |
| 5218 | 98.167 |
| 5219 | 98.167 |
| 5220 | 98.167 |
| 5221 | 98.333 |
| 5222 | 98.167 |
| 5223 | 97.667 |
| 5224 | 97.5 |
| 5225 | 96.833 |
| 5226 | 96.833 |
| 5227 | 96 |
| 5228 | 95.833 |
| 5229 | 95 |
| 5230 | 94.833 |
| 5231 | 94.5 |
| 5232 | 94.5 |
| 5233 | 94.667 |
| 5234 | 94.667 |
| 5235 | 94.333 |
| 5236 | 94.167 |
| 5237 | 93.167 |
| 5238 | 93.167 |
| 5239 | 92.167 |
| 5240 | 92.167 |
| 5241 | 91.333 |
| 5242 | 91.333 |
| 5243 | 90.5 |
| 5244 | 90.333 |
| 5245 | 90 |
| 5246 | 90 |
| 5247 | 89.167 |
| 5248 | 89 |
| 5249 | 88.167 |
| 5250 | 87.833 |
| 5251 | 87 |
| 5252 | 86.833 |
| 5253 | 85.833 |
| 5254 | 85.667 |
| 5255 | 84.5 |
| 5256 | 84.333 |
| 5257 | 83.5 |
| 5258 | 83.167 |
| 5259 | 82.333 |
| 5260 | 81.833 |
| 5261 | 81 |
| 5262 | 80.5 |
| 5263 | 80 |
| 5264 | 79.667 |
| 5265 | 79 |
| 5266 | 78.5 |
| 5267 | 78.167 |
| 5268 | 77.333 |
| 5269 | 77.333 |
| 5270 | 76.833 |
| 5271 | 76.667 |
| 5272 | 75.5 |
| 5273 | 75.167 |
| 5274 | 74.167 |
| 5275 | 74 |
| 5276 | 73 |
| 5277 | 72.833 |
| 5278 | 72 |
| 5279 | 71.833 |
| 5280 | 71 |
| 5281 | 70.667 |
| 5282 | 70.333 |
| 5283 | 70.167 |
| 5284 | 69.5 |
| 5285 | 69.167 |
| 5286 | 68.333 |
| 5287 | 67.833 |
| 5288 | 67.167 |
| 5289 | 67 |
| 5290 | 66.5 |
| 5291 | 65.833 |
| 5292 | 65.833 |
| 5293 | 65.167 |
| 5294 | 65.167 |
| 5295 | 64.833 |
| 5296 | 64.833 |
| 5297 | 64 |
| 5298 | 63.833 |
| 5299 | 63 |
| 5300 | 62.833 |
| 5301 | 62.167 |
| 5302 | 62 |
| 5303 | 60.833 |
| 5304 | 60.833 |
| 5305 | 59.667 |
| 5306 | 59.5 |
| 5307 | 58.667 |
| 5308 | 58.167 |
| 5309 | 57.5 |
| 5310 | 57.5 |
| 5311 | 56.667 |
| 5312 | 56.5 |
| 5313 | 55.167 |
| 5314 | 55 |
| 5315 | 54.333 |
| 5316 | 54 |
| 5317 | 53.333 |
| 5318 | 53 |
| 5319 | 52.333 |
| 5320 | 52.333 |
| 5321 | 51.833 |
| 5322 | 51.833 |
| 5323 | 51.5 |
| 5324 | 51.5 |
| 5325 | 50.833 |
| 5326 | 50.833 |
| 5327 | 50.333 |
| 5328 | 50.167 |
| 5329 | 49.833 |
| 5330 | 49.833 |
| 5331 | 48.833 |
| 5332 | 48.833 |
| 5333 | 48 |
| 5334 | 47.833 |
| 5335 | 46.833 |
| 5336 | 46.5 |
| 5337 | 45.833 |
| 5338 | 45.667 |
| 5339 | 45 |
| 5340 | 45 |
| 5341 | 43.667 |
| 5342 | 43.5 |
| 5343 | 41.833 |
| 5344 | 41.667 |
| 5345 | 39.833 |
| 5346 | 39.333 |
| 5347 | 38.833 |
| 5348 | 38.167 |
| 5349 | 38.167 |
| 5350 | 38.333 |
| 5351 | 38.333 |
| 5352 | 38.333 |
| 5353 | 38.333 |
| 5354 | 38.333 |
| 5355 | 39 |
| 5356 | 39 |
| 5357 | 39.5 |
| 5358 | 39.5 |
| 5359 | 39.333 |
| 5360 | 39.333 |
| 5361 | 39 |
| 5362 | 39 |
| 5363 | 38.667 |
| 5364 | 38.5 |
| 5365 | 38.5 |
| 5366 | 38.667 |
| 5367 | 38.833 |
| 5368 | 38.667 |
| 5369 | 38.667 |
| 5370 | 38.667 |
| 5371 | 38.333 |
| 5372 | 38.333 |
| 5373 | 38.167 |
| 5374 | 38.167 |
| 5375 | 38 |
| 5376 | 38 |
| 5377 | 38.333 |
| 5378 | 38.333 |
| 5379 | 38.5 |
| 5380 | 38.333 |
| 5381 | 38.833 |
| 5382 | 38.833 |
| 5383 | 39 |
| 5384 | 39 |
| 5385 | 38.833 |
| 5386 | 38.833 |
| 5387 | 38.333 |
| 5388 | 38.167 |
| 5389 | 37.5 |
| 5390 | 37.5 |
| 5391 | 37.167 |
| 5392 | 37 |
| 5393 | 37 |
| 5394 | 36.833 |
| 5395 | 37 |
| 5396 | 37 |
| 5397 | 37 |
| 5398 | 37.167 |
| 5399 | 37 |
| 5400 | 37 |
| 5401 | 36.833 |
| 5402 | 36.833 |
| 5403 | 36.833 |
| 5404 | 36.833 |
| 5405 | 36.833 |
| 5406 | 36.833 |
| 5407 | 36.667 |
| 5408 | 36.667 |
| 5409 | 36.5 |
| 5410 | 36.5 |
| 5411 | 36.333 |
| 5412 | 36.333 |
| 5413 | 36.333 |
| 5414 | 36.5 |
| 5415 | 36.333 |
| 5416 | 36.333 |
| 5417 | 36.167 |
| 5418 | 36.167 |
| 5419 | 36.167 |
| 5420 | 36.167 |
| 5421 | 36.167 |
| 5422 | 36.167 |
| 5423 | 36.167 |
| 5424 | 36.167 |
| 5425 | 36.5 |
| 5426 | 36.667 |
| 5427 | 37 |
| 5428 | 37.5 |
| 5429 | 37.5 |
| 5430 | 38.667 |
| 5431 | 38.833 |
| 5432 | 38.667 |
| 5433 | 38.833 |
| 5434 | 38.5 |
| 5435 | 38.5 |
| 5436 | 38 |
| 5437 | 37.833 |
| 5438 | 37.333 |
| 5439 | 37.333 |
| 5440 | 37 |
| 5441 | 36.833 |
| 5442 | 36.667 |
| 5443 | 36.667 |
| 5444 | 36.667 |
| 5445 | 36.833 |
| 5446 | 36.667 |
| 5447 | 36.667 |
| 5448 | 36.833 |
| 5449 | 36.833 |
| 5450 | 36.833 |
| 5451 | 36.667 |
| 5452 | 36.5 |
| 5453 | 36.5 |
| 5454 | 36.167 |
| 5455 | 36.167 |
| 5456 | 35.833 |
| 5457 | 35.833 |
| 5458 | 35 |
| 5459 | 35 |
| 5460 | 34.167 |
| 5461 | 34.167 |
| 5462 | 33.833 |
| 5463 | 33.667 |
| 5464 | 34.167 |
| 5465 | 34 |
| 5466 | 34.333 |
| 5467 | 34.333 |
| 5468 | 34.833 |
| 5469 | 34.667 |
| 5470 | 35.5 |
| 5471 | 35.5 |
| 5472 | 36 |
| 5473 | 36.167 |
| 5474 | 37 |
| 5475 | 37.333 |
| 5476 | 38 |
| 5477 | 38 |
| 5478 | 38.833 |
| 5479 | 38.833 |
| 5480 | 39.833 |
| 5481 | 39.833 |
| 5482 | 39.833 |
| 5483 | 39.667 |
| 5484 | 39.333 |
| 5485 | 39.167 |
| 5486 | 39.333 |
| 5487 | 39.333 |
| 5488 | 39.5 |
| 5489 | 39.5 |
| 5490 | 39.833 |
| 5491 | 39.667 |
| 5492 | 39.333 |
| 5493 | 39.333 |
| 5494 | 38.833 |
| 5495 | 38.667 |
| 5496 | 38.167 |
| 5497 | 37.833 |
| 5498 | 37.333 |
| 5499 | 37.333 |
| 5500 | 36.5 |
| 5501 | 36 |
| 5502 | 35.833 |
| 5503 | 35.5 |
| 5504 | 35.5 |
| 5505 | 35.333 |
| 5506 | 35.333 |
| 5507 | 35.167 |
| 5508 | 35.167 |
| 5509 | 34.833 |
| 5510 | 34.833 |
| 5511 | 34.333 |
| 5512 | 34.333 |
| 5513 | 33.667 |
| 5514 | 33.667 |
| 5515 | 33.167 |
| 5516 | 33 |
| 5517 | 32.333 |
| 5518 | 32.167 |
| 5519 | 31.833 |
| 5520 | 31.667 |
| 5521 | 31 |
| 5522 | 30.833 |
| 5523 | 30.167 |
| 5524 | 30 |
| 5525 | 29.5 |
| 5526 | 29.167 |
| 5527 | 28.833 |
| 5528 | 28.833 |
| 5529 | 28.833 |
| 5530 | 28.667 |
| 5531 | 28.5 |
| 5532 | 27.667 |
| 5533 | 27.5 |
| 5534 | 27.167 |
| 5535 | 27.167 |
| 5536 | 26.667 |
| 5537 | 26.667 |
| 5538 | 26.167 |
| 5539 | 26 |
| 5540 | 25.167 |
| 5541 | 24.833 |
| 5542 | 24.167 |
| 5543 | 24 |
| 5544 | 23.5 |
| 5545 | 23.167 |
| 5546 | 23.167 |
| 5547 | 22.667 |
| 5548 | 22.667 |
| 5549 | 22 |
| 5550 | 21.833 |
| 5551 | 21.167 |
| 5552 | 21.167 |
| 5553 | 20.667 |
| 5554 | 20.667 |
| 5555 | 20 |
| 5556 | 20 |
| 5557 | 19.333 |
| 5558 | 19.167 |
| 5559 | 18.667 |
| 5560 | 18.5 |
| 5561 | 18 |
| 5562 | 18 |
| 5563 | 17.333 |
| 5564 | 16.5 |
| 5565 | 16.333 |
| 5566 | 15.333 |
| 5567 | 15.167 |
| 5568 | 14.5 |
| 5569 | 14.333 |
| 5570 | 13.667 |
| 5571 | 13.5 |
| 5572 | 12.833 |
| 5573 | 12.333 |
| 5574 | 12.167 |
| 5575 | 11.333 |
| 5576 | 11.333 |
| 5577 | 11 |
| 5578 | 11 |
| 5579 | 10.667 |
| 5580 | 10.667 |
| 5581 | 10.5 |
| 5582 | 10.5 |
| 5583 | 10.167 |
| 5584 | 10.167 |
| 5585 | 9.833 |
| 5586 | 9.667 |
| 5587 | 9.333 |
| 5588 | 9.333 |
| 5589 | 8.5 |
| 5590 | 8.5 |
| 5591 | 7.5 |
| 5592 | 7.5 |
| 5593 | 6.667 |
| 5594 | 6.5 |
| 5595 | 5.833 |
| 5596 | 5.833 |
| 5597 | 5.333 |
| 5598 | 5.333 |
| 5599 | 4.667 |
| 5600 | 4.667 |
| 5601 | 4.167 |
| 5602 | 4.167 |
| 5603 | 4.167 |
| 5604 | 4 |
| 5605 | 3.667 |
| 5606 | 3.5 |
| 5607 | 3.333 |
| 5608 | 3.333 |
| 5609 | 3.167 |
| 5610 | 2.833 |
| 5611 | 2.5 |
| 5612 | 1.833 |
| 5613 | 1.833 |
| 5614 | 1.333 |
| 5615 | 1.5 |
| 5616 | 2.333 |
| 5617 | 2.333 |
| 5618 | 2.5 |
| 5619 | 2.667 |
| 5620 | 2.667 |
| 5621 | 2.667 |
| 5622 | 2.5 |
| 5623 | 2.5 |
| 5624 | 0.833 |
| 5625 | 0.667 |
| 5626 | 0.333 |
| 5627 | 0.333 |
| 5628 | 0 |
| 5629 | 0 |
| 5630 | -0.167 |
| 5631 | -0.167 |
| 5632 | -0.333 |
| 5633 | -0.167 |
| 5634 | 0 |
| 5635 | -0.167 |
| 5636 | -0.167 |
| 5637 | 0 |
| 5638 | 0 |
| 5639 | 0 |
| 5640 | 0 |
| 5641 | 0 |
| 5642 | -0.167 |
| 5643 | 0 |
| 5644 | 0 |
| 5645 | -0.167 |
| 5646 | -0.167 |
| 5647 | -0.167 |
| 5648 | -0.333 |
| 5649 | -0.333 |
| 5650 | -0.167 |
| 5651 | -0.167 |
| 5652 | -0.167 |
| 5653 | -0.167 |
| 5654 | -0.167 |
| 5655 | -0.333 |
| 5656 | -0.167 |
| 5657 | -0.333 |
| 5658 | -0.333 |
| 5659 | -0.167 |
| 5660 | 0 |
| 5661 | 0 |
| 5662 | -0.167 |
| 5663 | -0.167 |
| 5664 | 0 |
| 5665 | 0 |
| 5666 | -0.167 |
| 5667 | -0.167 |
| 5668 | -0.167 |
| 5669 | -0.167 |
| 5670 | -0.333 |
| 5671 | -0.167 |
| 5672 | -0.167 |
| 5673 | -0.167 |
| 5674 | -0.167 |
| 5675 | -0.167 |
| 5676 | -0.167 |
| 5677 | -0.167 |
| 5678 | -0.333 |
| 5679 | -0.167 |
| 5680 | -0.333 |